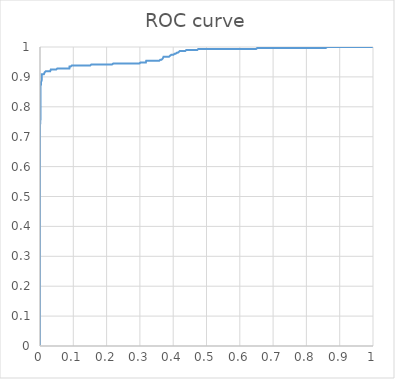
| Category | 1  -специфичность |
|---|---|
| 0.0 | 0.003 |
| 0.0 | 0.007 |
| 0.0 | 0.01 |
| 0.0 | 0.013 |
| 0.0 | 0.016 |
| 0.0 | 0.02 |
| 0.0 | 0.023 |
| 0.0 | 0.026 |
| 0.0 | 0.029 |
| 0.0 | 0.033 |
| 0.0 | 0.036 |
| 0.0 | 0.039 |
| 0.0 | 0.042 |
| 0.0 | 0.046 |
| 0.0 | 0.049 |
| 0.0 | 0.052 |
| 0.0 | 0.055 |
| 0.0 | 0.059 |
| 0.0 | 0.062 |
| 0.0 | 0.065 |
| 0.0 | 0.068 |
| 0.0 | 0.072 |
| 0.0 | 0.075 |
| 0.0 | 0.078 |
| 0.0 | 0.081 |
| 0.0 | 0.085 |
| 0.0 | 0.088 |
| 0.0 | 0.091 |
| 0.0 | 0.094 |
| 0.0 | 0.098 |
| 0.0 | 0.101 |
| 0.0 | 0.104 |
| 0.0 | 0.107 |
| 0.0 | 0.111 |
| 0.0 | 0.114 |
| 0.0 | 0.117 |
| 0.0 | 0.121 |
| 0.0 | 0.124 |
| 0.0 | 0.127 |
| 0.0 | 0.13 |
| 0.0 | 0.134 |
| 0.0 | 0.137 |
| 0.0 | 0.14 |
| 0.0 | 0.143 |
| 0.0 | 0.147 |
| 0.0 | 0.15 |
| 0.0 | 0.153 |
| 0.0 | 0.156 |
| 0.0 | 0.16 |
| 0.0 | 0.163 |
| 0.0 | 0.166 |
| 0.0 | 0.169 |
| 0.0 | 0.173 |
| 0.0 | 0.176 |
| 0.0 | 0.179 |
| 0.0 | 0.182 |
| 0.0 | 0.186 |
| 0.0 | 0.189 |
| 0.0 | 0.192 |
| 0.0 | 0.195 |
| 0.0 | 0.199 |
| 0.0 | 0.202 |
| 0.0 | 0.205 |
| 0.0 | 0.208 |
| 0.0 | 0.212 |
| 0.0 | 0.215 |
| 0.0 | 0.218 |
| 0.0 | 0.221 |
| 0.0 | 0.225 |
| 0.0 | 0.228 |
| 0.0 | 0.231 |
| 0.0 | 0.235 |
| 0.0 | 0.238 |
| 0.0 | 0.241 |
| 0.0 | 0.244 |
| 0.0 | 0.248 |
| 0.0 | 0.251 |
| 0.0 | 0.254 |
| 0.0 | 0.257 |
| 0.0 | 0.261 |
| 0.0 | 0.264 |
| 0.0 | 0.267 |
| 0.0 | 0.27 |
| 0.0 | 0.274 |
| 0.0 | 0.277 |
| 0.0 | 0.28 |
| 0.0 | 0.283 |
| 0.0 | 0.287 |
| 0.0 | 0.29 |
| 0.0 | 0.293 |
| 0.0 | 0.296 |
| 0.0 | 0.3 |
| 0.0 | 0.303 |
| 0.0 | 0.306 |
| 0.0 | 0.309 |
| 0.0 | 0.313 |
| 0.0 | 0.316 |
| 0.0 | 0.319 |
| 0.0 | 0.322 |
| 0.0 | 0.326 |
| 0.0 | 0.329 |
| 0.0 | 0.332 |
| 0.0 | 0.336 |
| 0.0 | 0.339 |
| 0.0 | 0.342 |
| 0.0 | 0.345 |
| 0.0 | 0.349 |
| 0.0 | 0.352 |
| 0.0 | 0.355 |
| 0.0 | 0.358 |
| 0.0 | 0.362 |
| 0.0 | 0.365 |
| 0.0 | 0.368 |
| 0.0 | 0.371 |
| 0.0 | 0.375 |
| 0.0 | 0.378 |
| 0.0 | 0.381 |
| 0.0 | 0.384 |
| 0.0 | 0.388 |
| 0.0 | 0.391 |
| 0.0 | 0.394 |
| 0.0 | 0.397 |
| 0.0 | 0.401 |
| 0.0 | 0.404 |
| 0.0 | 0.407 |
| 0.0 | 0.41 |
| 0.0 | 0.414 |
| 0.0 | 0.417 |
| 0.0 | 0.42 |
| 0.0 | 0.423 |
| 0.0 | 0.427 |
| 0.0 | 0.43 |
| 0.0 | 0.433 |
| 0.0 | 0.436 |
| 0.0 | 0.44 |
| 0.0 | 0.443 |
| 0.0 | 0.446 |
| 0.0 | 0.45 |
| 0.0 | 0.453 |
| 0.0 | 0.456 |
| 0.0 | 0.459 |
| 0.0 | 0.463 |
| 0.0 | 0.466 |
| 0.0 | 0.469 |
| 0.0 | 0.472 |
| 0.0 | 0.476 |
| 0.0 | 0.479 |
| 0.0 | 0.482 |
| 0.0 | 0.485 |
| 0.0 | 0.489 |
| 0.0 | 0.492 |
| 0.0 | 0.495 |
| 0.0 | 0.498 |
| 0.0 | 0.502 |
| 0.0 | 0.505 |
| 0.0 | 0.508 |
| 0.0 | 0.511 |
| 0.0 | 0.515 |
| 0.0 | 0.518 |
| 0.0 | 0.521 |
| 0.0 | 0.524 |
| 0.0 | 0.528 |
| 0.0 | 0.531 |
| 0.0 | 0.534 |
| 0.0 | 0.537 |
| 0.0 | 0.541 |
| 0.0 | 0.544 |
| 0.0 | 0.547 |
| 0.0 | 0.55 |
| 0.0 | 0.554 |
| 0.0 | 0.557 |
| 0.0 | 0.56 |
| 0.0 | 0.564 |
| 0.0 | 0.567 |
| 0.0 | 0.57 |
| 0.0 | 0.573 |
| 0.0 | 0.577 |
| 0.0 | 0.58 |
| 0.0 | 0.583 |
| 0.0 | 0.586 |
| 0.0 | 0.59 |
| 0.0 | 0.593 |
| 0.0 | 0.596 |
| 0.0 | 0.599 |
| 0.0 | 0.603 |
| 0.0 | 0.606 |
| 0.0 | 0.609 |
| 0.0 | 0.612 |
| 0.0 | 0.616 |
| 0.0 | 0.619 |
| 0.0 | 0.622 |
| 0.0 | 0.625 |
| 0.0 | 0.629 |
| 0.0 | 0.632 |
| 0.0 | 0.635 |
| 0.0 | 0.638 |
| 0.0 | 0.642 |
| 0.0 | 0.645 |
| 0.0 | 0.648 |
| 0.0 | 0.651 |
| 0.0 | 0.655 |
| 0.0 | 0.658 |
| 0.0 | 0.661 |
| 0.0 | 0.664 |
| 0.0 | 0.668 |
| 0.0 | 0.671 |
| 0.0 | 0.674 |
| 0.0 | 0.678 |
| 0.0 | 0.681 |
| 0.0 | 0.684 |
| 0.0 | 0.687 |
| 0.0 | 0.691 |
| 0.0 | 0.694 |
| 0.0 | 0.697 |
| 0.0 | 0.7 |
| 0.0 | 0.704 |
| 0.0 | 0.707 |
| 0.0 | 0.71 |
| 0.0 | 0.713 |
| 0.0 | 0.717 |
| 0.0 | 0.72 |
| 0.0 | 0.723 |
| 0.0 | 0.726 |
| 0.0 | 0.73 |
| 0.0 | 0.733 |
| 0.0 | 0.736 |
| 0.0 | 0.739 |
| 0.00046728971962616824 | 0.739 |
| 0.00046728971962616824 | 0.743 |
| 0.0009345794392523365 | 0.743 |
| 0.0009345794392523365 | 0.746 |
| 0.0009345794392523365 | 0.749 |
| 0.0009345794392523365 | 0.752 |
| 0.0014018691588785046 | 0.752 |
| 0.0014018691588785046 | 0.756 |
| 0.0014018691588785046 | 0.759 |
| 0.0014018691588785046 | 0.762 |
| 0.0014018691588785046 | 0.765 |
| 0.0014018691588785046 | 0.769 |
| 0.0014018691588785046 | 0.772 |
| 0.0014018691588785046 | 0.775 |
| 0.0014018691588785046 | 0.779 |
| 0.0014018691588785046 | 0.782 |
| 0.0014018691588785046 | 0.785 |
| 0.0014018691588785046 | 0.788 |
| 0.0014018691588785046 | 0.792 |
| 0.0014018691588785046 | 0.795 |
| 0.0014018691588785046 | 0.798 |
| 0.0014018691588785046 | 0.801 |
| 0.0014018691588785046 | 0.805 |
| 0.0014018691588785046 | 0.808 |
| 0.0014018691588785046 | 0.811 |
| 0.0014018691588785046 | 0.814 |
| 0.0014018691588785046 | 0.818 |
| 0.0014018691588785046 | 0.821 |
| 0.0014018691588785046 | 0.824 |
| 0.0014018691588785046 | 0.827 |
| 0.0014018691588785046 | 0.831 |
| 0.0014018691588785046 | 0.834 |
| 0.0014018691588785046 | 0.837 |
| 0.0014018691588785046 | 0.84 |
| 0.0014018691588785046 | 0.844 |
| 0.0014018691588785046 | 0.847 |
| 0.0014018691588785046 | 0.85 |
| 0.0014018691588785046 | 0.853 |
| 0.0014018691588785046 | 0.857 |
| 0.0014018691588785046 | 0.86 |
| 0.0014018691588785046 | 0.863 |
| 0.0014018691588785046 | 0.866 |
| 0.001869158878504673 | 0.866 |
| 0.001869158878504673 | 0.87 |
| 0.002336448598130841 | 0.87 |
| 0.002803738317757009 | 0.87 |
| 0.0032710280373831778 | 0.87 |
| 0.0032710280373831778 | 0.873 |
| 0.0032710280373831778 | 0.876 |
| 0.0032710280373831778 | 0.879 |
| 0.0032710280373831778 | 0.883 |
| 0.0032710280373831778 | 0.886 |
| 0.003738317757009346 | 0.886 |
| 0.004205607476635514 | 0.886 |
| 0.004672897196261682 | 0.886 |
| 0.0051401869158878505 | 0.886 |
| 0.0051401869158878505 | 0.889 |
| 0.0051401869158878505 | 0.893 |
| 0.0051401869158878505 | 0.896 |
| 0.0051401869158878505 | 0.899 |
| 0.0051401869158878505 | 0.902 |
| 0.0051401869158878505 | 0.906 |
| 0.0051401869158878505 | 0.909 |
| 0.005607476635514018 | 0.909 |
| 0.006074766355140187 | 0.909 |
| 0.0065420560747663555 | 0.909 |
| 0.007009345794392523 | 0.909 |
| 0.007476635514018692 | 0.909 |
| 0.00794392523364486 | 0.909 |
| 0.008411214953271028 | 0.909 |
| 0.008878504672897197 | 0.909 |
| 0.009345794392523364 | 0.909 |
| 0.009813084112149532 | 0.909 |
| 0.010280373831775701 | 0.909 |
| 0.01074766355140187 | 0.909 |
| 0.011214953271028037 | 0.909 |
| 0.011682242990654205 | 0.909 |
| 0.012149532710280374 | 0.909 |
| 0.012616822429906542 | 0.909 |
| 0.012616822429906542 | 0.912 |
| 0.013084112149532711 | 0.912 |
| 0.013551401869158878 | 0.912 |
| 0.014018691588785047 | 0.912 |
| 0.014018691588785047 | 0.915 |
| 0.014018691588785047 | 0.919 |
| 0.014485981308411215 | 0.919 |
| 0.014953271028037384 | 0.919 |
| 0.01542056074766355 | 0.919 |
| 0.01588785046728972 | 0.919 |
| 0.016355140186915886 | 0.919 |
| 0.016822429906542057 | 0.919 |
| 0.017289719626168223 | 0.919 |
| 0.017757009345794394 | 0.919 |
| 0.01822429906542056 | 0.919 |
| 0.018691588785046728 | 0.919 |
| 0.019158878504672898 | 0.919 |
| 0.019626168224299065 | 0.919 |
| 0.020093457943925235 | 0.919 |
| 0.020560747663551402 | 0.919 |
| 0.02102803738317757 | 0.919 |
| 0.02149532710280374 | 0.919 |
| 0.021962616822429906 | 0.919 |
| 0.022429906542056073 | 0.919 |
| 0.022897196261682243 | 0.919 |
| 0.02336448598130841 | 0.919 |
| 0.02383177570093458 | 0.919 |
| 0.024299065420560748 | 0.919 |
| 0.024766355140186914 | 0.919 |
| 0.025233644859813085 | 0.919 |
| 0.02570093457943925 | 0.919 |
| 0.026168224299065422 | 0.919 |
| 0.02663551401869159 | 0.919 |
| 0.027102803738317756 | 0.919 |
| 0.027570093457943926 | 0.919 |
| 0.028037383177570093 | 0.919 |
| 0.02850467289719626 | 0.919 |
| 0.02897196261682243 | 0.919 |
| 0.029439252336448597 | 0.919 |
| 0.029906542056074768 | 0.919 |
| 0.030373831775700934 | 0.919 |
| 0.0308411214953271 | 0.919 |
| 0.03130841121495327 | 0.919 |
| 0.03177570093457944 | 0.919 |
| 0.032242990654205606 | 0.919 |
| 0.03271028037383177 | 0.919 |
| 0.03271028037383177 | 0.922 |
| 0.03271028037383177 | 0.925 |
| 0.033177570093457946 | 0.925 |
| 0.03364485981308411 | 0.925 |
| 0.03411214953271028 | 0.925 |
| 0.03457943925233645 | 0.925 |
| 0.035046728971962614 | 0.925 |
| 0.03551401869158879 | 0.925 |
| 0.035981308411214954 | 0.925 |
| 0.03644859813084112 | 0.925 |
| 0.03691588785046729 | 0.925 |
| 0.037383177570093455 | 0.925 |
| 0.03785046728971963 | 0.925 |
| 0.038317757009345796 | 0.925 |
| 0.03878504672897196 | 0.925 |
| 0.03925233644859813 | 0.925 |
| 0.0397196261682243 | 0.925 |
| 0.04018691588785047 | 0.925 |
| 0.04065420560747664 | 0.925 |
| 0.041121495327102804 | 0.925 |
| 0.04158878504672897 | 0.925 |
| 0.04205607476635514 | 0.925 |
| 0.04252336448598131 | 0.925 |
| 0.04299065420560748 | 0.925 |
| 0.043457943925233646 | 0.925 |
| 0.04392523364485981 | 0.925 |
| 0.04439252336448598 | 0.925 |
| 0.044859813084112146 | 0.925 |
| 0.04532710280373832 | 0.925 |
| 0.04579439252336449 | 0.925 |
| 0.046261682242990654 | 0.925 |
| 0.04672897196261682 | 0.925 |
| 0.04719626168224299 | 0.925 |
| 0.04766355140186916 | 0.925 |
| 0.04813084112149533 | 0.925 |
| 0.048598130841121495 | 0.925 |
| 0.04906542056074766 | 0.925 |
| 0.04953271028037383 | 0.925 |
| 0.05 | 0.925 |
| 0.05046728971962617 | 0.925 |
| 0.05093457943925234 | 0.925 |
| 0.05093457943925234 | 0.928 |
| 0.0514018691588785 | 0.928 |
| 0.05186915887850467 | 0.928 |
| 0.052336448598130844 | 0.928 |
| 0.05280373831775701 | 0.928 |
| 0.05327102803738318 | 0.928 |
| 0.053738317757009345 | 0.928 |
| 0.05420560747663551 | 0.928 |
| 0.054672897196261686 | 0.928 |
| 0.05514018691588785 | 0.928 |
| 0.05560747663551402 | 0.928 |
| 0.056074766355140186 | 0.928 |
| 0.05654205607476635 | 0.928 |
| 0.05700934579439252 | 0.928 |
| 0.057476635514018694 | 0.928 |
| 0.05794392523364486 | 0.928 |
| 0.05841121495327103 | 0.928 |
| 0.058878504672897194 | 0.928 |
| 0.05934579439252336 | 0.928 |
| 0.059813084112149535 | 0.928 |
| 0.0602803738317757 | 0.928 |
| 0.06074766355140187 | 0.928 |
| 0.061214953271028036 | 0.928 |
| 0.0616822429906542 | 0.928 |
| 0.06214953271028038 | 0.928 |
| 0.06261682242990654 | 0.928 |
| 0.0630841121495327 | 0.928 |
| 0.06355140186915888 | 0.928 |
| 0.06401869158878505 | 0.928 |
| 0.06448598130841121 | 0.928 |
| 0.06495327102803738 | 0.928 |
| 0.06542056074766354 | 0.928 |
| 0.06588785046728972 | 0.928 |
| 0.06635514018691589 | 0.928 |
| 0.06682242990654205 | 0.928 |
| 0.06728971962616823 | 0.928 |
| 0.06775700934579439 | 0.928 |
| 0.06822429906542056 | 0.928 |
| 0.06869158878504673 | 0.928 |
| 0.0691588785046729 | 0.928 |
| 0.06962616822429907 | 0.928 |
| 0.07009345794392523 | 0.928 |
| 0.0705607476635514 | 0.928 |
| 0.07102803738317758 | 0.928 |
| 0.07149532710280374 | 0.928 |
| 0.07196261682242991 | 0.928 |
| 0.07242990654205607 | 0.928 |
| 0.07289719626168224 | 0.928 |
| 0.07336448598130842 | 0.928 |
| 0.07383177570093458 | 0.928 |
| 0.07429906542056075 | 0.928 |
| 0.07476635514018691 | 0.928 |
| 0.07523364485981308 | 0.928 |
| 0.07570093457943926 | 0.928 |
| 0.07616822429906542 | 0.928 |
| 0.07663551401869159 | 0.928 |
| 0.07710280373831775 | 0.928 |
| 0.07757009345794393 | 0.928 |
| 0.0780373831775701 | 0.928 |
| 0.07850467289719626 | 0.928 |
| 0.07897196261682243 | 0.928 |
| 0.0794392523364486 | 0.928 |
| 0.07990654205607477 | 0.928 |
| 0.08037383177570094 | 0.928 |
| 0.0808411214953271 | 0.928 |
| 0.08130841121495327 | 0.928 |
| 0.08177570093457943 | 0.928 |
| 0.08224299065420561 | 0.928 |
| 0.08271028037383178 | 0.928 |
| 0.08317757009345794 | 0.928 |
| 0.08364485981308412 | 0.928 |
| 0.08411214953271028 | 0.928 |
| 0.08457943925233645 | 0.928 |
| 0.08504672897196262 | 0.928 |
| 0.08551401869158878 | 0.928 |
| 0.08598130841121496 | 0.928 |
| 0.08644859813084112 | 0.928 |
| 0.08691588785046729 | 0.928 |
| 0.08738317757009346 | 0.928 |
| 0.08785046728971962 | 0.928 |
| 0.0883177570093458 | 0.928 |
| 0.08878504672897196 | 0.928 |
| 0.08878504672897196 | 0.932 |
| 0.08878504672897196 | 0.935 |
| 0.08925233644859813 | 0.935 |
| 0.08971962616822429 | 0.935 |
| 0.09018691588785047 | 0.935 |
| 0.09065420560747664 | 0.935 |
| 0.0911214953271028 | 0.935 |
| 0.09158878504672897 | 0.935 |
| 0.09205607476635513 | 0.935 |
| 0.09252336448598131 | 0.935 |
| 0.09299065420560748 | 0.935 |
| 0.09345794392523364 | 0.935 |
| 0.09392523364485982 | 0.935 |
| 0.09439252336448598 | 0.935 |
| 0.09485981308411215 | 0.935 |
| 0.09485981308411215 | 0.938 |
| 0.09532710280373832 | 0.938 |
| 0.09579439252336448 | 0.938 |
| 0.09626168224299066 | 0.938 |
| 0.09672897196261682 | 0.938 |
| 0.09719626168224299 | 0.938 |
| 0.09766355140186916 | 0.938 |
| 0.09813084112149532 | 0.938 |
| 0.0985981308411215 | 0.938 |
| 0.09906542056074766 | 0.938 |
| 0.09953271028037383 | 0.938 |
| 0.1 | 0.938 |
| 0.10046728971962617 | 0.938 |
| 0.10093457943925234 | 0.938 |
| 0.1014018691588785 | 0.938 |
| 0.10186915887850467 | 0.938 |
| 0.10233644859813085 | 0.938 |
| 0.102803738317757 | 0.938 |
| 0.10327102803738318 | 0.938 |
| 0.10373831775700934 | 0.938 |
| 0.10420560747663551 | 0.938 |
| 0.10467289719626169 | 0.938 |
| 0.10514018691588785 | 0.938 |
| 0.10560747663551402 | 0.938 |
| 0.10607476635514018 | 0.938 |
| 0.10654205607476636 | 0.938 |
| 0.10700934579439253 | 0.938 |
| 0.10747663551401869 | 0.938 |
| 0.10794392523364486 | 0.938 |
| 0.10841121495327102 | 0.938 |
| 0.1088785046728972 | 0.938 |
| 0.10934579439252337 | 0.938 |
| 0.10981308411214953 | 0.938 |
| 0.1102803738317757 | 0.938 |
| 0.11074766355140186 | 0.938 |
| 0.11121495327102804 | 0.938 |
| 0.11168224299065421 | 0.938 |
| 0.11214953271028037 | 0.938 |
| 0.11261682242990655 | 0.938 |
| 0.1130841121495327 | 0.938 |
| 0.11355140186915888 | 0.938 |
| 0.11401869158878504 | 0.938 |
| 0.11448598130841121 | 0.938 |
| 0.11495327102803739 | 0.938 |
| 0.11542056074766355 | 0.938 |
| 0.11588785046728972 | 0.938 |
| 0.11635514018691588 | 0.938 |
| 0.11682242990654206 | 0.938 |
| 0.11728971962616823 | 0.938 |
| 0.11775700934579439 | 0.938 |
| 0.11822429906542056 | 0.938 |
| 0.11869158878504672 | 0.938 |
| 0.1191588785046729 | 0.938 |
| 0.11962616822429907 | 0.938 |
| 0.12009345794392523 | 0.938 |
| 0.1205607476635514 | 0.938 |
| 0.12102803738317756 | 0.938 |
| 0.12149532710280374 | 0.938 |
| 0.12196261682242991 | 0.938 |
| 0.12242990654205607 | 0.938 |
| 0.12289719626168225 | 0.938 |
| 0.1233644859813084 | 0.938 |
| 0.12383177570093458 | 0.938 |
| 0.12429906542056075 | 0.938 |
| 0.12476635514018691 | 0.938 |
| 0.1252336448598131 | 0.938 |
| 0.12570093457943926 | 0.938 |
| 0.1261682242990654 | 0.938 |
| 0.12663551401869158 | 0.938 |
| 0.12710280373831775 | 0.938 |
| 0.12757009345794393 | 0.938 |
| 0.1280373831775701 | 0.938 |
| 0.12850467289719625 | 0.938 |
| 0.12897196261682242 | 0.938 |
| 0.1294392523364486 | 0.938 |
| 0.12990654205607477 | 0.938 |
| 0.13037383177570094 | 0.938 |
| 0.1308411214953271 | 0.938 |
| 0.13130841121495326 | 0.938 |
| 0.13177570093457944 | 0.938 |
| 0.1322429906542056 | 0.938 |
| 0.13271028037383178 | 0.938 |
| 0.13317757009345793 | 0.938 |
| 0.1336448598130841 | 0.938 |
| 0.13411214953271028 | 0.938 |
| 0.13457943925233645 | 0.938 |
| 0.13504672897196263 | 0.938 |
| 0.13551401869158877 | 0.938 |
| 0.13598130841121495 | 0.938 |
| 0.13644859813084112 | 0.938 |
| 0.1369158878504673 | 0.938 |
| 0.13738317757009347 | 0.938 |
| 0.1378504672897196 | 0.938 |
| 0.1383177570093458 | 0.938 |
| 0.13878504672897196 | 0.938 |
| 0.13925233644859814 | 0.938 |
| 0.1397196261682243 | 0.938 |
| 0.14018691588785046 | 0.938 |
| 0.14065420560747663 | 0.938 |
| 0.1411214953271028 | 0.938 |
| 0.14158878504672898 | 0.938 |
| 0.14205607476635515 | 0.938 |
| 0.1425233644859813 | 0.938 |
| 0.14299065420560747 | 0.938 |
| 0.14345794392523364 | 0.938 |
| 0.14392523364485982 | 0.938 |
| 0.144392523364486 | 0.938 |
| 0.14485981308411214 | 0.938 |
| 0.1453271028037383 | 0.938 |
| 0.14579439252336449 | 0.938 |
| 0.14626168224299066 | 0.938 |
| 0.14672897196261683 | 0.938 |
| 0.14719626168224298 | 0.938 |
| 0.14766355140186915 | 0.938 |
| 0.14813084112149533 | 0.938 |
| 0.1485981308411215 | 0.938 |
| 0.14906542056074767 | 0.938 |
| 0.14953271028037382 | 0.938 |
| 0.15 | 0.938 |
| 0.15046728971962617 | 0.938 |
| 0.15093457943925234 | 0.938 |
| 0.15093457943925234 | 0.941 |
| 0.15140186915887852 | 0.941 |
| 0.15186915887850466 | 0.941 |
| 0.15233644859813084 | 0.941 |
| 0.152803738317757 | 0.941 |
| 0.15327102803738318 | 0.941 |
| 0.15373831775700936 | 0.941 |
| 0.1542056074766355 | 0.941 |
| 0.15467289719626168 | 0.941 |
| 0.15514018691588785 | 0.941 |
| 0.15560747663551402 | 0.941 |
| 0.1560747663551402 | 0.941 |
| 0.15654205607476634 | 0.941 |
| 0.15700934579439252 | 0.941 |
| 0.1574766355140187 | 0.941 |
| 0.15794392523364487 | 0.941 |
| 0.15841121495327104 | 0.941 |
| 0.1588785046728972 | 0.941 |
| 0.15934579439252336 | 0.941 |
| 0.15981308411214953 | 0.941 |
| 0.1602803738317757 | 0.941 |
| 0.16074766355140188 | 0.941 |
| 0.16121495327102803 | 0.941 |
| 0.1616822429906542 | 0.941 |
| 0.16214953271028038 | 0.941 |
| 0.16261682242990655 | 0.941 |
| 0.16308411214953272 | 0.941 |
| 0.16355140186915887 | 0.941 |
| 0.16401869158878504 | 0.941 |
| 0.16448598130841122 | 0.941 |
| 0.1649532710280374 | 0.941 |
| 0.16542056074766356 | 0.941 |
| 0.1658878504672897 | 0.941 |
| 0.16635514018691588 | 0.941 |
| 0.16682242990654206 | 0.941 |
| 0.16728971962616823 | 0.941 |
| 0.1677570093457944 | 0.941 |
| 0.16822429906542055 | 0.941 |
| 0.16869158878504673 | 0.941 |
| 0.1691588785046729 | 0.941 |
| 0.16962616822429907 | 0.941 |
| 0.17009345794392525 | 0.941 |
| 0.1705607476635514 | 0.941 |
| 0.17102803738317757 | 0.941 |
| 0.17149532710280374 | 0.941 |
| 0.17196261682242991 | 0.941 |
| 0.1724299065420561 | 0.941 |
| 0.17289719626168223 | 0.941 |
| 0.1733644859813084 | 0.941 |
| 0.17383177570093458 | 0.941 |
| 0.17429906542056076 | 0.941 |
| 0.17476635514018693 | 0.941 |
| 0.17523364485981308 | 0.941 |
| 0.17570093457943925 | 0.941 |
| 0.17616822429906542 | 0.941 |
| 0.1766355140186916 | 0.941 |
| 0.17710280373831774 | 0.941 |
| 0.17757009345794392 | 0.941 |
| 0.1780373831775701 | 0.941 |
| 0.17850467289719626 | 0.941 |
| 0.17897196261682244 | 0.941 |
| 0.17943925233644858 | 0.941 |
| 0.17990654205607476 | 0.941 |
| 0.18037383177570093 | 0.941 |
| 0.1808411214953271 | 0.941 |
| 0.18130841121495328 | 0.941 |
| 0.18177570093457943 | 0.941 |
| 0.1822429906542056 | 0.941 |
| 0.18271028037383177 | 0.941 |
| 0.18317757009345795 | 0.941 |
| 0.18364485981308412 | 0.941 |
| 0.18411214953271027 | 0.941 |
| 0.18457943925233644 | 0.941 |
| 0.18504672897196262 | 0.941 |
| 0.1855140186915888 | 0.941 |
| 0.18598130841121496 | 0.941 |
| 0.1864485981308411 | 0.941 |
| 0.18691588785046728 | 0.941 |
| 0.18738317757009346 | 0.941 |
| 0.18785046728971963 | 0.941 |
| 0.1883177570093458 | 0.941 |
| 0.18878504672897195 | 0.941 |
| 0.18925233644859812 | 0.941 |
| 0.1897196261682243 | 0.941 |
| 0.19018691588785047 | 0.941 |
| 0.19065420560747665 | 0.941 |
| 0.1911214953271028 | 0.941 |
| 0.19158878504672897 | 0.941 |
| 0.19205607476635514 | 0.941 |
| 0.1925233644859813 | 0.941 |
| 0.1929906542056075 | 0.941 |
| 0.19345794392523363 | 0.941 |
| 0.1939252336448598 | 0.941 |
| 0.19439252336448598 | 0.941 |
| 0.19485981308411215 | 0.941 |
| 0.19532710280373833 | 0.941 |
| 0.19579439252336447 | 0.941 |
| 0.19626168224299065 | 0.941 |
| 0.19672897196261682 | 0.941 |
| 0.197196261682243 | 0.941 |
| 0.19766355140186917 | 0.941 |
| 0.19813084112149532 | 0.941 |
| 0.1985981308411215 | 0.941 |
| 0.19906542056074766 | 0.941 |
| 0.19953271028037384 | 0.941 |
| 0.2 | 0.941 |
| 0.20046728971962616 | 0.941 |
| 0.20093457943925233 | 0.941 |
| 0.2014018691588785 | 0.941 |
| 0.20186915887850468 | 0.941 |
| 0.20233644859813085 | 0.941 |
| 0.202803738317757 | 0.941 |
| 0.20327102803738317 | 0.941 |
| 0.20373831775700935 | 0.941 |
| 0.20420560747663552 | 0.941 |
| 0.2046728971962617 | 0.941 |
| 0.20514018691588784 | 0.941 |
| 0.205607476635514 | 0.941 |
| 0.2060747663551402 | 0.941 |
| 0.20654205607476636 | 0.941 |
| 0.20700934579439254 | 0.941 |
| 0.20747663551401868 | 0.941 |
| 0.20794392523364486 | 0.941 |
| 0.20841121495327103 | 0.941 |
| 0.2088785046728972 | 0.941 |
| 0.20934579439252338 | 0.941 |
| 0.20981308411214952 | 0.941 |
| 0.2102803738317757 | 0.941 |
| 0.21074766355140187 | 0.941 |
| 0.21121495327102804 | 0.941 |
| 0.21168224299065422 | 0.941 |
| 0.21214953271028036 | 0.941 |
| 0.21261682242990654 | 0.941 |
| 0.2130841121495327 | 0.941 |
| 0.21355140186915889 | 0.941 |
| 0.21401869158878506 | 0.941 |
| 0.2144859813084112 | 0.941 |
| 0.21495327102803738 | 0.941 |
| 0.21542056074766355 | 0.941 |
| 0.21588785046728973 | 0.941 |
| 0.2163551401869159 | 0.941 |
| 0.21682242990654205 | 0.941 |
| 0.21728971962616822 | 0.941 |
| 0.2177570093457944 | 0.941 |
| 0.21822429906542057 | 0.941 |
| 0.21869158878504674 | 0.941 |
| 0.21869158878504674 | 0.945 |
| 0.2191588785046729 | 0.945 |
| 0.21962616822429906 | 0.945 |
| 0.22009345794392524 | 0.945 |
| 0.2205607476635514 | 0.945 |
| 0.22102803738317758 | 0.945 |
| 0.22149532710280373 | 0.945 |
| 0.2219626168224299 | 0.945 |
| 0.22242990654205608 | 0.945 |
| 0.22289719626168225 | 0.945 |
| 0.22336448598130842 | 0.945 |
| 0.22383177570093457 | 0.945 |
| 0.22429906542056074 | 0.945 |
| 0.22476635514018692 | 0.945 |
| 0.2252336448598131 | 0.945 |
| 0.22570093457943924 | 0.945 |
| 0.2261682242990654 | 0.945 |
| 0.2266355140186916 | 0.945 |
| 0.22710280373831776 | 0.945 |
| 0.22757009345794393 | 0.945 |
| 0.22803738317757008 | 0.945 |
| 0.22850467289719625 | 0.945 |
| 0.22897196261682243 | 0.945 |
| 0.2294392523364486 | 0.945 |
| 0.22990654205607478 | 0.945 |
| 0.23037383177570092 | 0.945 |
| 0.2308411214953271 | 0.945 |
| 0.23130841121495327 | 0.945 |
| 0.23177570093457944 | 0.945 |
| 0.23224299065420562 | 0.945 |
| 0.23271028037383176 | 0.945 |
| 0.23317757009345794 | 0.945 |
| 0.2336448598130841 | 0.945 |
| 0.23411214953271028 | 0.945 |
| 0.23457943925233646 | 0.945 |
| 0.2350467289719626 | 0.945 |
| 0.23551401869158878 | 0.945 |
| 0.23598130841121495 | 0.945 |
| 0.23644859813084113 | 0.945 |
| 0.2369158878504673 | 0.945 |
| 0.23738317757009345 | 0.945 |
| 0.23785046728971962 | 0.945 |
| 0.2383177570093458 | 0.945 |
| 0.23878504672897197 | 0.945 |
| 0.23925233644859814 | 0.945 |
| 0.2397196261682243 | 0.945 |
| 0.24018691588785046 | 0.945 |
| 0.24065420560747663 | 0.945 |
| 0.2411214953271028 | 0.945 |
| 0.24158878504672898 | 0.945 |
| 0.24205607476635513 | 0.945 |
| 0.2425233644859813 | 0.945 |
| 0.24299065420560748 | 0.945 |
| 0.24345794392523365 | 0.945 |
| 0.24392523364485982 | 0.945 |
| 0.24439252336448597 | 0.945 |
| 0.24485981308411214 | 0.945 |
| 0.24532710280373832 | 0.945 |
| 0.2457943925233645 | 0.945 |
| 0.24626168224299066 | 0.945 |
| 0.2467289719626168 | 0.945 |
| 0.24719626168224298 | 0.945 |
| 0.24766355140186916 | 0.945 |
| 0.24813084112149533 | 0.945 |
| 0.2485981308411215 | 0.945 |
| 0.24906542056074765 | 0.945 |
| 0.24953271028037383 | 0.945 |
| 0.25 | 0.945 |
| 0.2504672897196262 | 0.945 |
| 0.25093457943925235 | 0.945 |
| 0.2514018691588785 | 0.945 |
| 0.2518691588785047 | 0.945 |
| 0.2523364485981308 | 0.945 |
| 0.252803738317757 | 0.945 |
| 0.25327102803738316 | 0.945 |
| 0.25373831775700934 | 0.945 |
| 0.2542056074766355 | 0.945 |
| 0.2546728971962617 | 0.945 |
| 0.25514018691588786 | 0.945 |
| 0.25560747663551403 | 0.945 |
| 0.2560747663551402 | 0.945 |
| 0.2565420560747664 | 0.945 |
| 0.2570093457943925 | 0.945 |
| 0.25747663551401867 | 0.945 |
| 0.25794392523364484 | 0.945 |
| 0.258411214953271 | 0.945 |
| 0.2588785046728972 | 0.945 |
| 0.25934579439252337 | 0.945 |
| 0.25981308411214954 | 0.945 |
| 0.2602803738317757 | 0.945 |
| 0.2607476635514019 | 0.945 |
| 0.26121495327102806 | 0.945 |
| 0.2616822429906542 | 0.945 |
| 0.26214953271028035 | 0.945 |
| 0.2626168224299065 | 0.945 |
| 0.2630841121495327 | 0.945 |
| 0.2635514018691589 | 0.945 |
| 0.26401869158878505 | 0.945 |
| 0.2644859813084112 | 0.945 |
| 0.2649532710280374 | 0.945 |
| 0.26542056074766357 | 0.945 |
| 0.26588785046728974 | 0.945 |
| 0.26635514018691586 | 0.945 |
| 0.26682242990654204 | 0.945 |
| 0.2672897196261682 | 0.945 |
| 0.2677570093457944 | 0.945 |
| 0.26822429906542056 | 0.945 |
| 0.26869158878504673 | 0.945 |
| 0.2691588785046729 | 0.945 |
| 0.2696261682242991 | 0.945 |
| 0.27009345794392525 | 0.945 |
| 0.2705607476635514 | 0.945 |
| 0.27102803738317754 | 0.945 |
| 0.2714953271028037 | 0.945 |
| 0.2719626168224299 | 0.945 |
| 0.27242990654205607 | 0.945 |
| 0.27289719626168224 | 0.945 |
| 0.2733644859813084 | 0.945 |
| 0.2738317757009346 | 0.945 |
| 0.27429906542056076 | 0.945 |
| 0.27476635514018694 | 0.945 |
| 0.2752336448598131 | 0.945 |
| 0.2757009345794392 | 0.945 |
| 0.2761682242990654 | 0.945 |
| 0.2766355140186916 | 0.945 |
| 0.27710280373831775 | 0.945 |
| 0.2775700934579439 | 0.945 |
| 0.2780373831775701 | 0.945 |
| 0.27850467289719627 | 0.945 |
| 0.27897196261682244 | 0.945 |
| 0.2794392523364486 | 0.945 |
| 0.2799065420560748 | 0.945 |
| 0.2803738317757009 | 0.945 |
| 0.2808411214953271 | 0.945 |
| 0.28130841121495326 | 0.945 |
| 0.28177570093457943 | 0.945 |
| 0.2822429906542056 | 0.945 |
| 0.2827102803738318 | 0.945 |
| 0.28317757009345795 | 0.945 |
| 0.2836448598130841 | 0.945 |
| 0.2841121495327103 | 0.945 |
| 0.2845794392523365 | 0.945 |
| 0.2850467289719626 | 0.945 |
| 0.28551401869158877 | 0.945 |
| 0.28598130841121494 | 0.945 |
| 0.2864485981308411 | 0.945 |
| 0.2869158878504673 | 0.945 |
| 0.28738317757009346 | 0.945 |
| 0.28785046728971964 | 0.945 |
| 0.2883177570093458 | 0.945 |
| 0.288785046728972 | 0.945 |
| 0.28925233644859816 | 0.945 |
| 0.2897196261682243 | 0.945 |
| 0.29018691588785045 | 0.945 |
| 0.2906542056074766 | 0.945 |
| 0.2911214953271028 | 0.945 |
| 0.29158878504672897 | 0.945 |
| 0.29205607476635514 | 0.945 |
| 0.2925233644859813 | 0.945 |
| 0.2929906542056075 | 0.945 |
| 0.29345794392523367 | 0.945 |
| 0.29392523364485984 | 0.945 |
| 0.29439252336448596 | 0.945 |
| 0.29485981308411213 | 0.945 |
| 0.2953271028037383 | 0.945 |
| 0.2957943925233645 | 0.945 |
| 0.29626168224299065 | 0.945 |
| 0.2967289719626168 | 0.945 |
| 0.297196261682243 | 0.945 |
| 0.2976635514018692 | 0.945 |
| 0.29813084112149535 | 0.945 |
| 0.2985981308411215 | 0.945 |
| 0.2985981308411215 | 0.948 |
| 0.29906542056074764 | 0.948 |
| 0.2995327102803738 | 0.948 |
| 0.3 | 0.948 |
| 0.30046728971962616 | 0.948 |
| 0.30093457943925234 | 0.948 |
| 0.3014018691588785 | 0.948 |
| 0.3018691588785047 | 0.948 |
| 0.30233644859813086 | 0.948 |
| 0.30280373831775703 | 0.948 |
| 0.30327102803738315 | 0.948 |
| 0.3037383177570093 | 0.948 |
| 0.3042056074766355 | 0.948 |
| 0.30467289719626167 | 0.948 |
| 0.30514018691588785 | 0.948 |
| 0.305607476635514 | 0.948 |
| 0.3060747663551402 | 0.948 |
| 0.30654205607476637 | 0.948 |
| 0.30700934579439254 | 0.948 |
| 0.3074766355140187 | 0.948 |
| 0.30794392523364483 | 0.948 |
| 0.308411214953271 | 0.948 |
| 0.3088785046728972 | 0.948 |
| 0.30934579439252335 | 0.948 |
| 0.30981308411214953 | 0.948 |
| 0.3102803738317757 | 0.948 |
| 0.3107476635514019 | 0.948 |
| 0.31121495327102805 | 0.948 |
| 0.3116822429906542 | 0.948 |
| 0.3121495327102804 | 0.948 |
| 0.3126168224299065 | 0.948 |
| 0.3130841121495327 | 0.948 |
| 0.31355140186915886 | 0.948 |
| 0.31401869158878504 | 0.948 |
| 0.3144859813084112 | 0.948 |
| 0.3149532710280374 | 0.948 |
| 0.31542056074766356 | 0.948 |
| 0.31588785046728973 | 0.948 |
| 0.3163551401869159 | 0.948 |
| 0.3168224299065421 | 0.948 |
| 0.3172897196261682 | 0.948 |
| 0.3177570093457944 | 0.948 |
| 0.31822429906542055 | 0.948 |
| 0.3186915887850467 | 0.948 |
| 0.3191588785046729 | 0.948 |
| 0.3191588785046729 | 0.951 |
| 0.3191588785046729 | 0.954 |
| 0.31962616822429907 | 0.954 |
| 0.32009345794392524 | 0.954 |
| 0.3205607476635514 | 0.954 |
| 0.3210280373831776 | 0.954 |
| 0.32149532710280376 | 0.954 |
| 0.3219626168224299 | 0.954 |
| 0.32242990654205606 | 0.954 |
| 0.32289719626168223 | 0.954 |
| 0.3233644859813084 | 0.954 |
| 0.3238317757009346 | 0.954 |
| 0.32429906542056075 | 0.954 |
| 0.3247663551401869 | 0.954 |
| 0.3252336448598131 | 0.954 |
| 0.32570093457943927 | 0.954 |
| 0.32616822429906545 | 0.954 |
| 0.32663551401869156 | 0.954 |
| 0.32710280373831774 | 0.954 |
| 0.3275700934579439 | 0.954 |
| 0.3280373831775701 | 0.954 |
| 0.32850467289719626 | 0.954 |
| 0.32897196261682243 | 0.954 |
| 0.3294392523364486 | 0.954 |
| 0.3299065420560748 | 0.954 |
| 0.33037383177570095 | 0.954 |
| 0.33084112149532713 | 0.954 |
| 0.33130841121495325 | 0.954 |
| 0.3317757009345794 | 0.954 |
| 0.3322429906542056 | 0.954 |
| 0.33271028037383177 | 0.954 |
| 0.33317757009345794 | 0.954 |
| 0.3336448598130841 | 0.954 |
| 0.3341121495327103 | 0.954 |
| 0.33457943925233646 | 0.954 |
| 0.33504672897196264 | 0.954 |
| 0.3355140186915888 | 0.954 |
| 0.33598130841121493 | 0.954 |
| 0.3364485981308411 | 0.954 |
| 0.3369158878504673 | 0.954 |
| 0.33738317757009345 | 0.954 |
| 0.3378504672897196 | 0.954 |
| 0.3383177570093458 | 0.954 |
| 0.338785046728972 | 0.954 |
| 0.33925233644859815 | 0.954 |
| 0.3397196261682243 | 0.954 |
| 0.3401869158878505 | 0.954 |
| 0.3406542056074766 | 0.954 |
| 0.3411214953271028 | 0.954 |
| 0.34158878504672896 | 0.954 |
| 0.34205607476635513 | 0.954 |
| 0.3425233644859813 | 0.954 |
| 0.3429906542056075 | 0.954 |
| 0.34345794392523366 | 0.954 |
| 0.34392523364485983 | 0.954 |
| 0.344392523364486 | 0.954 |
| 0.3448598130841122 | 0.954 |
| 0.3453271028037383 | 0.954 |
| 0.34579439252336447 | 0.954 |
| 0.34626168224299064 | 0.954 |
| 0.3467289719626168 | 0.954 |
| 0.347196261682243 | 0.954 |
| 0.34766355140186916 | 0.954 |
| 0.34813084112149534 | 0.954 |
| 0.3485981308411215 | 0.954 |
| 0.3490654205607477 | 0.954 |
| 0.34953271028037386 | 0.954 |
| 0.35 | 0.954 |
| 0.35046728971962615 | 0.954 |
| 0.3509345794392523 | 0.954 |
| 0.3514018691588785 | 0.954 |
| 0.3518691588785047 | 0.954 |
| 0.35233644859813085 | 0.954 |
| 0.352803738317757 | 0.954 |
| 0.3532710280373832 | 0.954 |
| 0.35373831775700937 | 0.954 |
| 0.3542056074766355 | 0.954 |
| 0.35467289719626166 | 0.954 |
| 0.35514018691588783 | 0.954 |
| 0.355607476635514 | 0.954 |
| 0.3560747663551402 | 0.954 |
| 0.35654205607476636 | 0.954 |
| 0.35700934579439253 | 0.954 |
| 0.3574766355140187 | 0.954 |
| 0.3579439252336449 | 0.954 |
| 0.35841121495327105 | 0.954 |
| 0.35887850467289717 | 0.954 |
| 0.35887850467289717 | 0.958 |
| 0.35934579439252334 | 0.958 |
| 0.3598130841121495 | 0.958 |
| 0.3602803738317757 | 0.958 |
| 0.36074766355140186 | 0.958 |
| 0.36121495327102804 | 0.958 |
| 0.3616822429906542 | 0.958 |
| 0.3621495327102804 | 0.958 |
| 0.36261682242990656 | 0.958 |
| 0.36308411214953273 | 0.958 |
| 0.36355140186915885 | 0.958 |
| 0.364018691588785 | 0.958 |
| 0.3644859813084112 | 0.958 |
| 0.3649532710280374 | 0.958 |
| 0.36542056074766355 | 0.958 |
| 0.36542056074766355 | 0.961 |
| 0.3658878504672897 | 0.961 |
| 0.3663551401869159 | 0.961 |
| 0.36682242990654207 | 0.961 |
| 0.36728971962616824 | 0.961 |
| 0.3677570093457944 | 0.961 |
| 0.36822429906542054 | 0.961 |
| 0.3686915887850467 | 0.961 |
| 0.3691588785046729 | 0.961 |
| 0.36962616822429906 | 0.961 |
| 0.37009345794392523 | 0.961 |
| 0.3705607476635514 | 0.961 |
| 0.3710280373831776 | 0.961 |
| 0.3710280373831776 | 0.964 |
| 0.3710280373831776 | 0.967 |
| 0.37149532710280375 | 0.967 |
| 0.3719626168224299 | 0.967 |
| 0.3724299065420561 | 0.967 |
| 0.3728971962616822 | 0.967 |
| 0.3733644859813084 | 0.967 |
| 0.37383177570093457 | 0.967 |
| 0.37429906542056074 | 0.967 |
| 0.3747663551401869 | 0.967 |
| 0.3752336448598131 | 0.967 |
| 0.37570093457943926 | 0.967 |
| 0.37616822429906543 | 0.967 |
| 0.3766355140186916 | 0.967 |
| 0.3771028037383178 | 0.967 |
| 0.3775700934579439 | 0.967 |
| 0.3780373831775701 | 0.967 |
| 0.37850467289719625 | 0.967 |
| 0.3789719626168224 | 0.967 |
| 0.3794392523364486 | 0.967 |
| 0.37990654205607477 | 0.967 |
| 0.38037383177570094 | 0.967 |
| 0.3808411214953271 | 0.967 |
| 0.3813084112149533 | 0.967 |
| 0.38177570093457946 | 0.967 |
| 0.3822429906542056 | 0.967 |
| 0.38271028037383176 | 0.967 |
| 0.38317757009345793 | 0.967 |
| 0.3836448598130841 | 0.967 |
| 0.3841121495327103 | 0.967 |
| 0.38457943925233645 | 0.967 |
| 0.3850467289719626 | 0.967 |
| 0.3855140186915888 | 0.967 |
| 0.385981308411215 | 0.967 |
| 0.38644859813084115 | 0.967 |
| 0.38691588785046727 | 0.967 |
| 0.38738317757009344 | 0.967 |
| 0.3878504672897196 | 0.967 |
| 0.3883177570093458 | 0.967 |
| 0.38878504672897196 | 0.967 |
| 0.38925233644859814 | 0.967 |
| 0.38925233644859814 | 0.971 |
| 0.3897196261682243 | 0.971 |
| 0.3901869158878505 | 0.971 |
| 0.39065420560747666 | 0.971 |
| 0.39112149532710283 | 0.971 |
| 0.39158878504672895 | 0.971 |
| 0.3920560747663551 | 0.971 |
| 0.3925233644859813 | 0.971 |
| 0.3925233644859813 | 0.974 |
| 0.39299065420560747 | 0.974 |
| 0.39345794392523364 | 0.974 |
| 0.3939252336448598 | 0.974 |
| 0.394392523364486 | 0.974 |
| 0.39485981308411217 | 0.974 |
| 0.39532710280373834 | 0.974 |
| 0.3957943925233645 | 0.974 |
| 0.39626168224299063 | 0.974 |
| 0.3967289719626168 | 0.974 |
| 0.397196261682243 | 0.974 |
| 0.39766355140186915 | 0.974 |
| 0.3981308411214953 | 0.974 |
| 0.3985981308411215 | 0.974 |
| 0.3990654205607477 | 0.974 |
| 0.39953271028037385 | 0.974 |
| 0.4 | 0.974 |
| 0.40046728971962614 | 0.974 |
| 0.4009345794392523 | 0.974 |
| 0.4014018691588785 | 0.974 |
| 0.40186915887850466 | 0.974 |
| 0.40233644859813084 | 0.974 |
| 0.402803738317757 | 0.974 |
| 0.4032710280373832 | 0.974 |
| 0.4032710280373832 | 0.977 |
| 0.40373831775700936 | 0.977 |
| 0.40420560747663553 | 0.977 |
| 0.4046728971962617 | 0.977 |
| 0.4051401869158878 | 0.977 |
| 0.405607476635514 | 0.977 |
| 0.40607476635514017 | 0.977 |
| 0.40654205607476634 | 0.977 |
| 0.4070093457943925 | 0.977 |
| 0.4074766355140187 | 0.977 |
| 0.40794392523364487 | 0.977 |
| 0.40841121495327104 | 0.977 |
| 0.4088785046728972 | 0.977 |
| 0.4093457943925234 | 0.977 |
| 0.4098130841121495 | 0.977 |
| 0.4098130841121495 | 0.98 |
| 0.4102803738317757 | 0.98 |
| 0.41074766355140185 | 0.98 |
| 0.411214953271028 | 0.98 |
| 0.4116822429906542 | 0.98 |
| 0.4121495327102804 | 0.98 |
| 0.41261682242990655 | 0.98 |
| 0.4130841121495327 | 0.98 |
| 0.4135514018691589 | 0.98 |
| 0.41401869158878507 | 0.98 |
| 0.4144859813084112 | 0.98 |
| 0.41495327102803736 | 0.98 |
| 0.41542056074766354 | 0.98 |
| 0.4158878504672897 | 0.98 |
| 0.4158878504672897 | 0.984 |
| 0.4163551401869159 | 0.984 |
| 0.41682242990654206 | 0.984 |
| 0.41682242990654206 | 0.987 |
| 0.41728971962616823 | 0.987 |
| 0.4177570093457944 | 0.987 |
| 0.4182242990654206 | 0.987 |
| 0.41869158878504675 | 0.987 |
| 0.41915887850467287 | 0.987 |
| 0.41962616822429905 | 0.987 |
| 0.4200934579439252 | 0.987 |
| 0.4205607476635514 | 0.987 |
| 0.42102803738317757 | 0.987 |
| 0.42149532710280374 | 0.987 |
| 0.4219626168224299 | 0.987 |
| 0.4224299065420561 | 0.987 |
| 0.42289719626168226 | 0.987 |
| 0.42336448598130844 | 0.987 |
| 0.42383177570093455 | 0.987 |
| 0.42429906542056073 | 0.987 |
| 0.4247663551401869 | 0.987 |
| 0.4252336448598131 | 0.987 |
| 0.42570093457943925 | 0.987 |
| 0.4261682242990654 | 0.987 |
| 0.4266355140186916 | 0.987 |
| 0.42710280373831777 | 0.987 |
| 0.42757009345794394 | 0.987 |
| 0.4280373831775701 | 0.987 |
| 0.42850467289719624 | 0.987 |
| 0.4289719626168224 | 0.987 |
| 0.4294392523364486 | 0.987 |
| 0.42990654205607476 | 0.987 |
| 0.43037383177570093 | 0.987 |
| 0.4308411214953271 | 0.987 |
| 0.4313084112149533 | 0.987 |
| 0.43177570093457945 | 0.987 |
| 0.4322429906542056 | 0.987 |
| 0.4327102803738318 | 0.987 |
| 0.4331775700934579 | 0.987 |
| 0.4336448598130841 | 0.987 |
| 0.43411214953271027 | 0.987 |
| 0.43457943925233644 | 0.987 |
| 0.4350467289719626 | 0.987 |
| 0.4355140186915888 | 0.987 |
| 0.43598130841121496 | 0.987 |
| 0.43644859813084114 | 0.987 |
| 0.4369158878504673 | 0.987 |
| 0.4373831775700935 | 0.987 |
| 0.4373831775700935 | 0.99 |
| 0.4378504672897196 | 0.99 |
| 0.4383177570093458 | 0.99 |
| 0.43878504672897195 | 0.99 |
| 0.4392523364485981 | 0.99 |
| 0.4397196261682243 | 0.99 |
| 0.44018691588785047 | 0.99 |
| 0.44065420560747665 | 0.99 |
| 0.4411214953271028 | 0.99 |
| 0.441588785046729 | 0.99 |
| 0.44205607476635517 | 0.99 |
| 0.4425233644859813 | 0.99 |
| 0.44299065420560746 | 0.99 |
| 0.44345794392523363 | 0.99 |
| 0.4439252336448598 | 0.99 |
| 0.444392523364486 | 0.99 |
| 0.44485981308411215 | 0.99 |
| 0.44532710280373833 | 0.99 |
| 0.4457943925233645 | 0.99 |
| 0.4462616822429907 | 0.99 |
| 0.44672897196261685 | 0.99 |
| 0.44719626168224297 | 0.99 |
| 0.44766355140186914 | 0.99 |
| 0.4481308411214953 | 0.99 |
| 0.4485981308411215 | 0.99 |
| 0.44906542056074766 | 0.99 |
| 0.44953271028037384 | 0.99 |
| 0.45 | 0.99 |
| 0.4504672897196262 | 0.99 |
| 0.45093457943925236 | 0.99 |
| 0.4514018691588785 | 0.99 |
| 0.45186915887850465 | 0.99 |
| 0.4523364485981308 | 0.99 |
| 0.452803738317757 | 0.99 |
| 0.4532710280373832 | 0.99 |
| 0.45373831775700935 | 0.99 |
| 0.4542056074766355 | 0.99 |
| 0.4546728971962617 | 0.99 |
| 0.45514018691588787 | 0.99 |
| 0.45560747663551404 | 0.99 |
| 0.45607476635514016 | 0.99 |
| 0.45654205607476633 | 0.99 |
| 0.4570093457943925 | 0.99 |
| 0.4574766355140187 | 0.99 |
| 0.45794392523364486 | 0.99 |
| 0.45841121495327103 | 0.99 |
| 0.4588785046728972 | 0.99 |
| 0.4593457943925234 | 0.99 |
| 0.45981308411214955 | 0.99 |
| 0.4602803738317757 | 0.99 |
| 0.46074766355140184 | 0.99 |
| 0.461214953271028 | 0.99 |
| 0.4616822429906542 | 0.99 |
| 0.46214953271028036 | 0.99 |
| 0.46261682242990654 | 0.99 |
| 0.4630841121495327 | 0.99 |
| 0.4635514018691589 | 0.99 |
| 0.46401869158878506 | 0.99 |
| 0.46448598130841123 | 0.99 |
| 0.4649532710280374 | 0.99 |
| 0.4654205607476635 | 0.99 |
| 0.4658878504672897 | 0.99 |
| 0.4663551401869159 | 0.99 |
| 0.46682242990654205 | 0.99 |
| 0.4672897196261682 | 0.99 |
| 0.4677570093457944 | 0.99 |
| 0.46822429906542057 | 0.99 |
| 0.46869158878504674 | 0.99 |
| 0.4691588785046729 | 0.99 |
| 0.4696261682242991 | 0.99 |
| 0.4700934579439252 | 0.99 |
| 0.4705607476635514 | 0.99 |
| 0.47102803738317756 | 0.99 |
| 0.47149532710280373 | 0.99 |
| 0.4719626168224299 | 0.99 |
| 0.4724299065420561 | 0.99 |
| 0.47289719626168225 | 0.99 |
| 0.4733644859813084 | 0.99 |
| 0.4738317757009346 | 0.99 |
| 0.4738317757009346 | 0.993 |
| 0.4742990654205608 | 0.993 |
| 0.4747663551401869 | 0.993 |
| 0.47523364485981306 | 0.993 |
| 0.47570093457943924 | 0.993 |
| 0.4761682242990654 | 0.993 |
| 0.4766355140186916 | 0.993 |
| 0.47710280373831776 | 0.993 |
| 0.47757009345794393 | 0.993 |
| 0.4780373831775701 | 0.993 |
| 0.4785046728971963 | 0.993 |
| 0.47897196261682246 | 0.993 |
| 0.4794392523364486 | 0.993 |
| 0.47990654205607475 | 0.993 |
| 0.4803738317757009 | 0.993 |
| 0.4808411214953271 | 0.993 |
| 0.48130841121495327 | 0.993 |
| 0.48177570093457944 | 0.993 |
| 0.4822429906542056 | 0.993 |
| 0.4827102803738318 | 0.993 |
| 0.48317757009345796 | 0.993 |
| 0.48364485981308414 | 0.993 |
| 0.48411214953271026 | 0.993 |
| 0.48457943925233643 | 0.993 |
| 0.4850467289719626 | 0.993 |
| 0.4855140186915888 | 0.993 |
| 0.48598130841121495 | 0.993 |
| 0.4864485981308411 | 0.993 |
| 0.4869158878504673 | 0.993 |
| 0.4873831775700935 | 0.993 |
| 0.48785046728971965 | 0.993 |
| 0.4883177570093458 | 0.993 |
| 0.48878504672897194 | 0.993 |
| 0.4892523364485981 | 0.993 |
| 0.4897196261682243 | 0.993 |
| 0.49018691588785046 | 0.993 |
| 0.49065420560747663 | 0.993 |
| 0.4911214953271028 | 0.993 |
| 0.491588785046729 | 0.993 |
| 0.49205607476635516 | 0.993 |
| 0.49252336448598133 | 0.993 |
| 0.4929906542056075 | 0.993 |
| 0.4934579439252336 | 0.993 |
| 0.4939252336448598 | 0.993 |
| 0.49439252336448597 | 0.993 |
| 0.49485981308411214 | 0.993 |
| 0.4953271028037383 | 0.993 |
| 0.4957943925233645 | 0.993 |
| 0.49626168224299066 | 0.993 |
| 0.49672897196261684 | 0.993 |
| 0.497196261682243 | 0.993 |
| 0.4976635514018692 | 0.993 |
| 0.4981308411214953 | 0.993 |
| 0.4985981308411215 | 0.993 |
| 0.49906542056074765 | 0.993 |
| 0.4995327102803738 | 0.993 |
| 0.5 | 0.993 |
| 0.5004672897196262 | 0.993 |
| 0.5009345794392523 | 0.993 |
| 0.5014018691588785 | 0.993 |
| 0.5018691588785047 | 0.993 |
| 0.5023364485981309 | 0.993 |
| 0.502803738317757 | 0.993 |
| 0.5032710280373832 | 0.993 |
| 0.5037383177570094 | 0.993 |
| 0.5042056074766356 | 0.993 |
| 0.5046728971962616 | 0.993 |
| 0.5051401869158878 | 0.993 |
| 0.505607476635514 | 0.993 |
| 0.5060747663551401 | 0.993 |
| 0.5065420560747663 | 0.993 |
| 0.5070093457943925 | 0.993 |
| 0.5074766355140187 | 0.993 |
| 0.5079439252336448 | 0.993 |
| 0.508411214953271 | 0.993 |
| 0.5088785046728972 | 0.993 |
| 0.5093457943925234 | 0.993 |
| 0.5098130841121495 | 0.993 |
| 0.5102803738317757 | 0.993 |
| 0.5107476635514019 | 0.993 |
| 0.5112149532710281 | 0.993 |
| 0.5116822429906542 | 0.993 |
| 0.5121495327102804 | 0.993 |
| 0.5126168224299066 | 0.993 |
| 0.5130841121495328 | 0.993 |
| 0.5135514018691589 | 0.993 |
| 0.514018691588785 | 0.993 |
| 0.5144859813084112 | 0.993 |
| 0.5149532710280373 | 0.993 |
| 0.5154205607476635 | 0.993 |
| 0.5158878504672897 | 0.993 |
| 0.5163551401869159 | 0.993 |
| 0.516822429906542 | 0.993 |
| 0.5172897196261682 | 0.993 |
| 0.5177570093457944 | 0.993 |
| 0.5182242990654206 | 0.993 |
| 0.5186915887850467 | 0.993 |
| 0.5191588785046729 | 0.993 |
| 0.5196261682242991 | 0.993 |
| 0.5200934579439253 | 0.993 |
| 0.5205607476635514 | 0.993 |
| 0.5210280373831776 | 0.993 |
| 0.5214953271028038 | 0.993 |
| 0.52196261682243 | 0.993 |
| 0.5224299065420561 | 0.993 |
| 0.5228971962616823 | 0.993 |
| 0.5233644859813084 | 0.993 |
| 0.5238317757009345 | 0.993 |
| 0.5242990654205607 | 0.993 |
| 0.5247663551401869 | 0.993 |
| 0.525233644859813 | 0.993 |
| 0.5257009345794392 | 0.993 |
| 0.5261682242990654 | 0.993 |
| 0.5266355140186916 | 0.993 |
| 0.5271028037383177 | 0.993 |
| 0.5275700934579439 | 0.993 |
| 0.5280373831775701 | 0.993 |
| 0.5285046728971963 | 0.993 |
| 0.5289719626168224 | 0.993 |
| 0.5294392523364486 | 0.993 |
| 0.5299065420560748 | 0.993 |
| 0.530373831775701 | 0.993 |
| 0.5308411214953271 | 0.993 |
| 0.5313084112149533 | 0.993 |
| 0.5317757009345795 | 0.993 |
| 0.5322429906542057 | 0.993 |
| 0.5327102803738317 | 0.993 |
| 0.5331775700934579 | 0.993 |
| 0.5336448598130841 | 0.993 |
| 0.5341121495327102 | 0.993 |
| 0.5345794392523364 | 0.993 |
| 0.5350467289719626 | 0.993 |
| 0.5355140186915888 | 0.993 |
| 0.5359813084112149 | 0.993 |
| 0.5364485981308411 | 0.993 |
| 0.5369158878504673 | 0.993 |
| 0.5373831775700935 | 0.993 |
| 0.5378504672897196 | 0.993 |
| 0.5383177570093458 | 0.993 |
| 0.538785046728972 | 0.993 |
| 0.5392523364485982 | 0.993 |
| 0.5397196261682243 | 0.993 |
| 0.5401869158878505 | 0.993 |
| 0.5406542056074767 | 0.993 |
| 0.5411214953271029 | 0.993 |
| 0.541588785046729 | 0.993 |
| 0.5420560747663551 | 0.993 |
| 0.5425233644859813 | 0.993 |
| 0.5429906542056074 | 0.993 |
| 0.5434579439252336 | 0.993 |
| 0.5439252336448598 | 0.993 |
| 0.544392523364486 | 0.993 |
| 0.5448598130841121 | 0.993 |
| 0.5453271028037383 | 0.993 |
| 0.5457943925233645 | 0.993 |
| 0.5462616822429907 | 0.993 |
| 0.5467289719626168 | 0.993 |
| 0.547196261682243 | 0.993 |
| 0.5476635514018692 | 0.993 |
| 0.5481308411214953 | 0.993 |
| 0.5485981308411215 | 0.993 |
| 0.5490654205607477 | 0.993 |
| 0.5495327102803739 | 0.993 |
| 0.55 | 0.993 |
| 0.5504672897196262 | 0.993 |
| 0.5509345794392523 | 0.993 |
| 0.5514018691588785 | 0.993 |
| 0.5518691588785046 | 0.993 |
| 0.5523364485981308 | 0.993 |
| 0.552803738317757 | 0.993 |
| 0.5532710280373832 | 0.993 |
| 0.5537383177570093 | 0.993 |
| 0.5542056074766355 | 0.993 |
| 0.5546728971962617 | 0.993 |
| 0.5551401869158878 | 0.993 |
| 0.555607476635514 | 0.993 |
| 0.5560747663551402 | 0.993 |
| 0.5565420560747664 | 0.993 |
| 0.5570093457943925 | 0.993 |
| 0.5574766355140187 | 0.993 |
| 0.5579439252336449 | 0.993 |
| 0.5584112149532711 | 0.993 |
| 0.5588785046728972 | 0.993 |
| 0.5593457943925234 | 0.993 |
| 0.5598130841121496 | 0.993 |
| 0.5602803738317756 | 0.993 |
| 0.5607476635514018 | 0.993 |
| 0.561214953271028 | 0.993 |
| 0.5616822429906542 | 0.993 |
| 0.5621495327102803 | 0.993 |
| 0.5626168224299065 | 0.993 |
| 0.5630841121495327 | 0.993 |
| 0.5635514018691589 | 0.993 |
| 0.564018691588785 | 0.993 |
| 0.5644859813084112 | 0.993 |
| 0.5649532710280374 | 0.993 |
| 0.5654205607476636 | 0.993 |
| 0.5658878504672897 | 0.993 |
| 0.5663551401869159 | 0.993 |
| 0.5668224299065421 | 0.993 |
| 0.5672897196261683 | 0.993 |
| 0.5677570093457944 | 0.993 |
| 0.5682242990654206 | 0.993 |
| 0.5686915887850468 | 0.993 |
| 0.569158878504673 | 0.993 |
| 0.569626168224299 | 0.993 |
| 0.5700934579439252 | 0.993 |
| 0.5705607476635514 | 0.993 |
| 0.5710280373831775 | 0.993 |
| 0.5714953271028037 | 0.993 |
| 0.5719626168224299 | 0.993 |
| 0.572429906542056 | 0.993 |
| 0.5728971962616822 | 0.993 |
| 0.5733644859813084 | 0.993 |
| 0.5738317757009346 | 0.993 |
| 0.5742990654205608 | 0.993 |
| 0.5747663551401869 | 0.993 |
| 0.5752336448598131 | 0.993 |
| 0.5757009345794393 | 0.993 |
| 0.5761682242990654 | 0.993 |
| 0.5766355140186916 | 0.993 |
| 0.5771028037383178 | 0.993 |
| 0.577570093457944 | 0.993 |
| 0.5780373831775701 | 0.993 |
| 0.5785046728971963 | 0.993 |
| 0.5789719626168224 | 0.993 |
| 0.5794392523364486 | 0.993 |
| 0.5799065420560747 | 0.993 |
| 0.5803738317757009 | 0.993 |
| 0.5808411214953271 | 0.993 |
| 0.5813084112149532 | 0.993 |
| 0.5817757009345794 | 0.993 |
| 0.5822429906542056 | 0.993 |
| 0.5827102803738318 | 0.993 |
| 0.5831775700934579 | 0.993 |
| 0.5836448598130841 | 0.993 |
| 0.5841121495327103 | 0.993 |
| 0.5845794392523365 | 0.993 |
| 0.5850467289719626 | 0.993 |
| 0.5855140186915888 | 0.993 |
| 0.585981308411215 | 0.993 |
| 0.5864485981308412 | 0.993 |
| 0.5869158878504673 | 0.993 |
| 0.5873831775700935 | 0.993 |
| 0.5878504672897197 | 0.993 |
| 0.5883177570093457 | 0.993 |
| 0.5887850467289719 | 0.993 |
| 0.5892523364485981 | 0.993 |
| 0.5897196261682243 | 0.993 |
| 0.5901869158878504 | 0.993 |
| 0.5906542056074766 | 0.993 |
| 0.5911214953271028 | 0.993 |
| 0.591588785046729 | 0.993 |
| 0.5920560747663551 | 0.993 |
| 0.5925233644859813 | 0.993 |
| 0.5929906542056075 | 0.993 |
| 0.5934579439252337 | 0.993 |
| 0.5939252336448598 | 0.993 |
| 0.594392523364486 | 0.993 |
| 0.5948598130841122 | 0.993 |
| 0.5953271028037384 | 0.993 |
| 0.5957943925233645 | 0.993 |
| 0.5962616822429907 | 0.993 |
| 0.5967289719626169 | 0.993 |
| 0.597196261682243 | 0.993 |
| 0.5976635514018691 | 0.993 |
| 0.5981308411214953 | 0.993 |
| 0.5985981308411215 | 0.993 |
| 0.5990654205607476 | 0.993 |
| 0.5995327102803738 | 0.993 |
| 0.6 | 0.993 |
| 0.6004672897196262 | 0.993 |
| 0.6009345794392523 | 0.993 |
| 0.6014018691588785 | 0.993 |
| 0.6018691588785047 | 0.993 |
| 0.6023364485981308 | 0.993 |
| 0.602803738317757 | 0.993 |
| 0.6032710280373832 | 0.993 |
| 0.6037383177570094 | 0.993 |
| 0.6042056074766355 | 0.993 |
| 0.6046728971962617 | 0.993 |
| 0.6051401869158879 | 0.993 |
| 0.6056074766355141 | 0.993 |
| 0.6060747663551402 | 0.993 |
| 0.6065420560747663 | 0.993 |
| 0.6070093457943925 | 0.993 |
| 0.6074766355140186 | 0.993 |
| 0.6079439252336448 | 0.993 |
| 0.608411214953271 | 0.993 |
| 0.6088785046728972 | 0.993 |
| 0.6093457943925233 | 0.993 |
| 0.6098130841121495 | 0.993 |
| 0.6102803738317757 | 0.993 |
| 0.6107476635514019 | 0.993 |
| 0.611214953271028 | 0.993 |
| 0.6116822429906542 | 0.993 |
| 0.6121495327102804 | 0.993 |
| 0.6126168224299066 | 0.993 |
| 0.6130841121495327 | 0.993 |
| 0.6135514018691589 | 0.993 |
| 0.6140186915887851 | 0.993 |
| 0.6144859813084113 | 0.993 |
| 0.6149532710280374 | 0.993 |
| 0.6154205607476636 | 0.993 |
| 0.6158878504672897 | 0.993 |
| 0.6163551401869158 | 0.993 |
| 0.616822429906542 | 0.993 |
| 0.6172897196261682 | 0.993 |
| 0.6177570093457944 | 0.993 |
| 0.6182242990654205 | 0.993 |
| 0.6186915887850467 | 0.993 |
| 0.6191588785046729 | 0.993 |
| 0.6196261682242991 | 0.993 |
| 0.6200934579439252 | 0.993 |
| 0.6205607476635514 | 0.993 |
| 0.6210280373831776 | 0.993 |
| 0.6214953271028038 | 0.993 |
| 0.6219626168224299 | 0.993 |
| 0.6224299065420561 | 0.993 |
| 0.6228971962616823 | 0.993 |
| 0.6233644859813084 | 0.993 |
| 0.6238317757009346 | 0.993 |
| 0.6242990654205608 | 0.993 |
| 0.624766355140187 | 0.993 |
| 0.625233644859813 | 0.993 |
| 0.6257009345794392 | 0.993 |
| 0.6261682242990654 | 0.993 |
| 0.6266355140186916 | 0.993 |
| 0.6271028037383177 | 0.993 |
| 0.6275700934579439 | 0.993 |
| 0.6280373831775701 | 0.993 |
| 0.6285046728971962 | 0.993 |
| 0.6289719626168224 | 0.993 |
| 0.6294392523364486 | 0.993 |
| 0.6299065420560748 | 0.993 |
| 0.6303738317757009 | 0.993 |
| 0.6308411214953271 | 0.993 |
| 0.6313084112149533 | 0.993 |
| 0.6317757009345795 | 0.993 |
| 0.6322429906542056 | 0.993 |
| 0.6327102803738318 | 0.993 |
| 0.633177570093458 | 0.993 |
| 0.6336448598130842 | 0.993 |
| 0.6341121495327103 | 0.993 |
| 0.6345794392523364 | 0.993 |
| 0.6350467289719626 | 0.993 |
| 0.6355140186915887 | 0.993 |
| 0.6359813084112149 | 0.993 |
| 0.6364485981308411 | 0.993 |
| 0.6369158878504673 | 0.993 |
| 0.6373831775700934 | 0.993 |
| 0.6378504672897196 | 0.993 |
| 0.6383177570093458 | 0.993 |
| 0.638785046728972 | 0.993 |
| 0.6392523364485981 | 0.993 |
| 0.6397196261682243 | 0.993 |
| 0.6401869158878505 | 0.993 |
| 0.6406542056074767 | 0.993 |
| 0.6411214953271028 | 0.993 |
| 0.641588785046729 | 0.993 |
| 0.6420560747663552 | 0.993 |
| 0.6425233644859814 | 0.993 |
| 0.6429906542056075 | 0.993 |
| 0.6434579439252337 | 0.993 |
| 0.6439252336448598 | 0.993 |
| 0.6443925233644859 | 0.993 |
| 0.6448598130841121 | 0.993 |
| 0.6453271028037383 | 0.993 |
| 0.6457943925233645 | 0.993 |
| 0.6462616822429906 | 0.993 |
| 0.6467289719626168 | 0.993 |
| 0.647196261682243 | 0.993 |
| 0.6476635514018692 | 0.993 |
| 0.6481308411214953 | 0.993 |
| 0.6485981308411215 | 0.993 |
| 0.6490654205607477 | 0.993 |
| 0.6495327102803738 | 0.993 |
| 0.65 | 0.993 |
| 0.6504672897196262 | 0.993 |
| 0.6509345794392524 | 0.993 |
| 0.6514018691588785 | 0.993 |
| 0.6514018691588785 | 0.997 |
| 0.6518691588785047 | 0.997 |
| 0.6523364485981309 | 0.997 |
| 0.652803738317757 | 0.997 |
| 0.6532710280373831 | 0.997 |
| 0.6537383177570093 | 0.997 |
| 0.6542056074766355 | 0.997 |
| 0.6546728971962616 | 0.997 |
| 0.6551401869158878 | 0.997 |
| 0.655607476635514 | 0.997 |
| 0.6560747663551402 | 0.997 |
| 0.6565420560747663 | 0.997 |
| 0.6570093457943925 | 0.997 |
| 0.6574766355140187 | 0.997 |
| 0.6579439252336449 | 0.997 |
| 0.658411214953271 | 0.997 |
| 0.6588785046728972 | 0.997 |
| 0.6593457943925234 | 0.997 |
| 0.6598130841121496 | 0.997 |
| 0.6602803738317757 | 0.997 |
| 0.6607476635514019 | 0.997 |
| 0.6612149532710281 | 0.997 |
| 0.6616822429906543 | 0.997 |
| 0.6621495327102803 | 0.997 |
| 0.6626168224299065 | 0.997 |
| 0.6630841121495327 | 0.997 |
| 0.6635514018691588 | 0.997 |
| 0.664018691588785 | 0.997 |
| 0.6644859813084112 | 0.997 |
| 0.6649532710280374 | 0.997 |
| 0.6654205607476635 | 0.997 |
| 0.6658878504672897 | 0.997 |
| 0.6663551401869159 | 0.997 |
| 0.6668224299065421 | 0.997 |
| 0.6672897196261682 | 0.997 |
| 0.6677570093457944 | 0.997 |
| 0.6682242990654206 | 0.997 |
| 0.6686915887850468 | 0.997 |
| 0.6691588785046729 | 0.997 |
| 0.6696261682242991 | 0.997 |
| 0.6700934579439253 | 0.997 |
| 0.6705607476635514 | 0.997 |
| 0.6710280373831776 | 0.997 |
| 0.6714953271028037 | 0.997 |
| 0.6719626168224299 | 0.997 |
| 0.672429906542056 | 0.997 |
| 0.6728971962616822 | 0.997 |
| 0.6733644859813084 | 0.997 |
| 0.6738317757009346 | 0.997 |
| 0.6742990654205607 | 0.997 |
| 0.6747663551401869 | 0.997 |
| 0.6752336448598131 | 0.997 |
| 0.6757009345794392 | 0.997 |
| 0.6761682242990654 | 0.997 |
| 0.6766355140186916 | 0.997 |
| 0.6771028037383178 | 0.997 |
| 0.677570093457944 | 0.997 |
| 0.6780373831775701 | 0.997 |
| 0.6785046728971963 | 0.997 |
| 0.6789719626168225 | 0.997 |
| 0.6794392523364486 | 0.997 |
| 0.6799065420560748 | 0.997 |
| 0.680373831775701 | 0.997 |
| 0.680841121495327 | 0.997 |
| 0.6813084112149532 | 0.997 |
| 0.6817757009345794 | 0.997 |
| 0.6822429906542056 | 0.997 |
| 0.6827102803738317 | 0.997 |
| 0.6831775700934579 | 0.997 |
| 0.6836448598130841 | 0.997 |
| 0.6841121495327103 | 0.997 |
| 0.6845794392523364 | 0.997 |
| 0.6850467289719626 | 0.997 |
| 0.6855140186915888 | 0.997 |
| 0.685981308411215 | 0.997 |
| 0.6864485981308411 | 0.997 |
| 0.6869158878504673 | 0.997 |
| 0.6873831775700935 | 0.997 |
| 0.6878504672897197 | 0.997 |
| 0.6883177570093458 | 0.997 |
| 0.688785046728972 | 0.997 |
| 0.6892523364485982 | 0.997 |
| 0.6897196261682244 | 0.997 |
| 0.6901869158878504 | 0.997 |
| 0.6906542056074766 | 0.997 |
| 0.6911214953271028 | 0.997 |
| 0.6915887850467289 | 0.997 |
| 0.6920560747663551 | 0.997 |
| 0.6925233644859813 | 0.997 |
| 0.6929906542056075 | 0.997 |
| 0.6934579439252336 | 0.997 |
| 0.6939252336448598 | 0.997 |
| 0.694392523364486 | 0.997 |
| 0.6948598130841122 | 0.997 |
| 0.6953271028037383 | 0.997 |
| 0.6957943925233645 | 0.997 |
| 0.6962616822429907 | 0.997 |
| 0.6967289719626168 | 0.997 |
| 0.697196261682243 | 0.997 |
| 0.6976635514018692 | 0.997 |
| 0.6981308411214954 | 0.997 |
| 0.6985981308411215 | 0.997 |
| 0.6990654205607477 | 0.997 |
| 0.6995327102803738 | 0.997 |
| 0.7 | 0.997 |
| 0.7004672897196261 | 0.997 |
| 0.7009345794392523 | 0.997 |
| 0.7014018691588785 | 0.997 |
| 0.7018691588785047 | 0.997 |
| 0.7023364485981308 | 0.997 |
| 0.702803738317757 | 0.997 |
| 0.7032710280373832 | 0.997 |
| 0.7037383177570093 | 0.997 |
| 0.7042056074766355 | 0.997 |
| 0.7046728971962617 | 0.997 |
| 0.7051401869158879 | 0.997 |
| 0.705607476635514 | 0.997 |
| 0.7060747663551402 | 0.997 |
| 0.7065420560747664 | 0.997 |
| 0.7070093457943926 | 0.997 |
| 0.7074766355140187 | 0.997 |
| 0.7079439252336449 | 0.997 |
| 0.708411214953271 | 0.997 |
| 0.7088785046728971 | 0.997 |
| 0.7093457943925233 | 0.997 |
| 0.7098130841121495 | 0.997 |
| 0.7102803738317757 | 0.997 |
| 0.7107476635514018 | 0.997 |
| 0.711214953271028 | 0.997 |
| 0.7116822429906542 | 0.997 |
| 0.7121495327102804 | 0.997 |
| 0.7126168224299065 | 0.997 |
| 0.7130841121495327 | 0.997 |
| 0.7135514018691589 | 0.997 |
| 0.7140186915887851 | 0.997 |
| 0.7144859813084112 | 0.997 |
| 0.7149532710280374 | 0.997 |
| 0.7154205607476636 | 0.997 |
| 0.7158878504672898 | 0.997 |
| 0.7163551401869159 | 0.997 |
| 0.7168224299065421 | 0.997 |
| 0.7172897196261683 | 0.997 |
| 0.7177570093457943 | 0.997 |
| 0.7182242990654205 | 0.997 |
| 0.7186915887850467 | 0.997 |
| 0.7191588785046729 | 0.997 |
| 0.719626168224299 | 0.997 |
| 0.7200934579439252 | 0.997 |
| 0.7205607476635514 | 0.997 |
| 0.7210280373831776 | 0.997 |
| 0.7214953271028037 | 0.997 |
| 0.7219626168224299 | 0.997 |
| 0.7224299065420561 | 0.997 |
| 0.7228971962616823 | 0.997 |
| 0.7233644859813084 | 0.997 |
| 0.7238317757009346 | 0.997 |
| 0.7242990654205608 | 0.997 |
| 0.724766355140187 | 0.997 |
| 0.7252336448598131 | 0.997 |
| 0.7257009345794393 | 0.997 |
| 0.7261682242990655 | 0.997 |
| 0.7266355140186916 | 0.997 |
| 0.7271028037383177 | 0.997 |
| 0.7275700934579439 | 0.997 |
| 0.72803738317757 | 0.997 |
| 0.7285046728971962 | 0.997 |
| 0.7289719626168224 | 0.997 |
| 0.7294392523364486 | 0.997 |
| 0.7299065420560747 | 0.997 |
| 0.7303738317757009 | 0.997 |
| 0.7308411214953271 | 0.997 |
| 0.7313084112149533 | 0.997 |
| 0.7317757009345794 | 0.997 |
| 0.7322429906542056 | 0.997 |
| 0.7327102803738318 | 0.997 |
| 0.733177570093458 | 0.997 |
| 0.7336448598130841 | 0.997 |
| 0.7341121495327103 | 0.997 |
| 0.7345794392523365 | 0.997 |
| 0.7350467289719627 | 0.997 |
| 0.7355140186915888 | 0.997 |
| 0.735981308411215 | 0.997 |
| 0.7364485981308411 | 0.997 |
| 0.7369158878504672 | 0.997 |
| 0.7373831775700934 | 0.997 |
| 0.7378504672897196 | 0.997 |
| 0.7383177570093458 | 0.997 |
| 0.7387850467289719 | 0.997 |
| 0.7392523364485981 | 0.997 |
| 0.7397196261682243 | 0.997 |
| 0.7401869158878505 | 0.997 |
| 0.7406542056074766 | 0.997 |
| 0.7411214953271028 | 0.997 |
| 0.741588785046729 | 0.997 |
| 0.7420560747663552 | 0.997 |
| 0.7425233644859813 | 0.997 |
| 0.7429906542056075 | 0.997 |
| 0.7434579439252337 | 0.997 |
| 0.7439252336448599 | 0.997 |
| 0.744392523364486 | 0.997 |
| 0.7448598130841122 | 0.997 |
| 0.7453271028037384 | 0.997 |
| 0.7457943925233644 | 0.997 |
| 0.7462616822429906 | 0.997 |
| 0.7467289719626168 | 0.997 |
| 0.747196261682243 | 0.997 |
| 0.7476635514018691 | 0.997 |
| 0.7481308411214953 | 0.997 |
| 0.7485981308411215 | 0.997 |
| 0.7490654205607477 | 0.997 |
| 0.7495327102803738 | 0.997 |
| 0.75 | 0.997 |
| 0.7504672897196262 | 0.997 |
| 0.7509345794392523 | 0.997 |
| 0.7514018691588785 | 0.997 |
| 0.7518691588785047 | 0.997 |
| 0.7523364485981309 | 0.997 |
| 0.752803738317757 | 0.997 |
| 0.7532710280373832 | 0.997 |
| 0.7537383177570094 | 0.997 |
| 0.7542056074766356 | 0.997 |
| 0.7546728971962616 | 0.997 |
| 0.7551401869158878 | 0.997 |
| 0.755607476635514 | 0.997 |
| 0.7560747663551401 | 0.997 |
| 0.7565420560747663 | 0.997 |
| 0.7570093457943925 | 0.997 |
| 0.7574766355140187 | 0.997 |
| 0.7579439252336448 | 0.997 |
| 0.758411214953271 | 0.997 |
| 0.7588785046728972 | 0.997 |
| 0.7593457943925234 | 0.997 |
| 0.7598130841121495 | 0.997 |
| 0.7602803738317757 | 0.997 |
| 0.7607476635514019 | 0.997 |
| 0.7612149532710281 | 0.997 |
| 0.7616822429906542 | 0.997 |
| 0.7621495327102804 | 0.997 |
| 0.7626168224299066 | 0.997 |
| 0.7630841121495328 | 0.997 |
| 0.7635514018691589 | 0.997 |
| 0.764018691588785 | 0.997 |
| 0.7644859813084112 | 0.997 |
| 0.7649532710280373 | 0.997 |
| 0.7654205607476635 | 0.997 |
| 0.7658878504672897 | 0.997 |
| 0.7663551401869159 | 0.997 |
| 0.766822429906542 | 0.997 |
| 0.7672897196261682 | 0.997 |
| 0.7677570093457944 | 0.997 |
| 0.7682242990654206 | 0.997 |
| 0.7686915887850467 | 0.997 |
| 0.7691588785046729 | 0.997 |
| 0.7696261682242991 | 0.997 |
| 0.7700934579439253 | 0.997 |
| 0.7705607476635514 | 0.997 |
| 0.7710280373831776 | 0.997 |
| 0.7714953271028038 | 0.997 |
| 0.77196261682243 | 0.997 |
| 0.7724299065420561 | 0.997 |
| 0.7728971962616823 | 0.997 |
| 0.7733644859813084 | 0.997 |
| 0.7738317757009345 | 0.997 |
| 0.7742990654205607 | 0.997 |
| 0.7747663551401869 | 0.997 |
| 0.775233644859813 | 0.997 |
| 0.7757009345794392 | 0.997 |
| 0.7761682242990654 | 0.997 |
| 0.7766355140186916 | 0.997 |
| 0.7771028037383177 | 0.997 |
| 0.7775700934579439 | 0.997 |
| 0.7780373831775701 | 0.997 |
| 0.7785046728971963 | 0.997 |
| 0.7789719626168224 | 0.997 |
| 0.7794392523364486 | 0.997 |
| 0.7799065420560748 | 0.997 |
| 0.780373831775701 | 0.997 |
| 0.7808411214953271 | 0.997 |
| 0.7813084112149533 | 0.997 |
| 0.7817757009345795 | 0.997 |
| 0.7822429906542057 | 0.997 |
| 0.7827102803738317 | 0.997 |
| 0.7831775700934579 | 0.997 |
| 0.7836448598130841 | 0.997 |
| 0.7841121495327102 | 0.997 |
| 0.7845794392523364 | 0.997 |
| 0.7850467289719626 | 0.997 |
| 0.7855140186915888 | 0.997 |
| 0.7859813084112149 | 0.997 |
| 0.7864485981308411 | 0.997 |
| 0.7869158878504673 | 0.997 |
| 0.7873831775700935 | 0.997 |
| 0.7878504672897196 | 0.997 |
| 0.7883177570093458 | 0.997 |
| 0.788785046728972 | 0.997 |
| 0.7892523364485982 | 0.997 |
| 0.7897196261682243 | 0.997 |
| 0.7901869158878505 | 0.997 |
| 0.7906542056074767 | 0.997 |
| 0.7911214953271029 | 0.997 |
| 0.791588785046729 | 0.997 |
| 0.7920560747663551 | 0.997 |
| 0.7925233644859813 | 0.997 |
| 0.7929906542056074 | 0.997 |
| 0.7934579439252336 | 0.997 |
| 0.7939252336448598 | 0.997 |
| 0.794392523364486 | 0.997 |
| 0.7948598130841121 | 0.997 |
| 0.7953271028037383 | 0.997 |
| 0.7957943925233645 | 0.997 |
| 0.7962616822429907 | 0.997 |
| 0.7967289719626168 | 0.997 |
| 0.797196261682243 | 0.997 |
| 0.7976635514018692 | 0.997 |
| 0.7981308411214953 | 0.997 |
| 0.7985981308411215 | 0.997 |
| 0.7990654205607477 | 0.997 |
| 0.7995327102803739 | 0.997 |
| 0.8 | 0.997 |
| 0.8004672897196262 | 0.997 |
| 0.8009345794392523 | 0.997 |
| 0.8014018691588785 | 0.997 |
| 0.8018691588785046 | 0.997 |
| 0.8023364485981308 | 0.997 |
| 0.802803738317757 | 0.997 |
| 0.8032710280373832 | 0.997 |
| 0.8037383177570093 | 0.997 |
| 0.8042056074766355 | 0.997 |
| 0.8046728971962617 | 0.997 |
| 0.8051401869158878 | 0.997 |
| 0.805607476635514 | 0.997 |
| 0.8060747663551402 | 0.997 |
| 0.8065420560747664 | 0.997 |
| 0.8070093457943925 | 0.997 |
| 0.8074766355140187 | 0.997 |
| 0.8079439252336449 | 0.997 |
| 0.8084112149532711 | 0.997 |
| 0.8088785046728972 | 0.997 |
| 0.8093457943925234 | 0.997 |
| 0.8098130841121496 | 0.997 |
| 0.8102803738317756 | 0.997 |
| 0.8107476635514018 | 0.997 |
| 0.811214953271028 | 0.997 |
| 0.8116822429906542 | 0.997 |
| 0.8121495327102803 | 0.997 |
| 0.8126168224299065 | 0.997 |
| 0.8130841121495327 | 0.997 |
| 0.8135514018691589 | 0.997 |
| 0.814018691588785 | 0.997 |
| 0.8144859813084112 | 0.997 |
| 0.8149532710280374 | 0.997 |
| 0.8154205607476636 | 0.997 |
| 0.8158878504672897 | 0.997 |
| 0.8163551401869159 | 0.997 |
| 0.8168224299065421 | 0.997 |
| 0.8172897196261683 | 0.997 |
| 0.8177570093457944 | 0.997 |
| 0.8182242990654206 | 0.997 |
| 0.8186915887850468 | 0.997 |
| 0.819158878504673 | 0.997 |
| 0.819626168224299 | 0.997 |
| 0.8200934579439252 | 0.997 |
| 0.8205607476635514 | 0.997 |
| 0.8210280373831775 | 0.997 |
| 0.8214953271028037 | 0.997 |
| 0.8219626168224299 | 0.997 |
| 0.822429906542056 | 0.997 |
| 0.8228971962616822 | 0.997 |
| 0.8233644859813084 | 0.997 |
| 0.8238317757009346 | 0.997 |
| 0.8242990654205608 | 0.997 |
| 0.8247663551401869 | 0.997 |
| 0.8252336448598131 | 0.997 |
| 0.8257009345794393 | 0.997 |
| 0.8261682242990654 | 0.997 |
| 0.8266355140186916 | 0.997 |
| 0.8271028037383178 | 0.997 |
| 0.827570093457944 | 0.997 |
| 0.8280373831775701 | 0.997 |
| 0.8285046728971963 | 0.997 |
| 0.8289719626168224 | 0.997 |
| 0.8294392523364486 | 0.997 |
| 0.8299065420560747 | 0.997 |
| 0.8303738317757009 | 0.997 |
| 0.8308411214953271 | 0.997 |
| 0.8313084112149532 | 0.997 |
| 0.8317757009345794 | 0.997 |
| 0.8322429906542056 | 0.997 |
| 0.8327102803738318 | 0.997 |
| 0.8331775700934579 | 0.997 |
| 0.8336448598130841 | 0.997 |
| 0.8341121495327103 | 0.997 |
| 0.8345794392523365 | 0.997 |
| 0.8350467289719626 | 0.997 |
| 0.8355140186915888 | 0.997 |
| 0.835981308411215 | 0.997 |
| 0.8364485981308412 | 0.997 |
| 0.8369158878504673 | 0.997 |
| 0.8373831775700935 | 0.997 |
| 0.8378504672897197 | 0.997 |
| 0.8383177570093457 | 0.997 |
| 0.8387850467289719 | 0.997 |
| 0.8392523364485981 | 0.997 |
| 0.8397196261682243 | 0.997 |
| 0.8401869158878504 | 0.997 |
| 0.8406542056074766 | 0.997 |
| 0.8411214953271028 | 0.997 |
| 0.841588785046729 | 0.997 |
| 0.8420560747663551 | 0.997 |
| 0.8425233644859813 | 0.997 |
| 0.8429906542056075 | 0.997 |
| 0.8434579439252337 | 0.997 |
| 0.8439252336448598 | 0.997 |
| 0.844392523364486 | 0.997 |
| 0.8448598130841122 | 0.997 |
| 0.8453271028037384 | 0.997 |
| 0.8457943925233645 | 0.997 |
| 0.8462616822429907 | 0.997 |
| 0.8467289719626169 | 0.997 |
| 0.847196261682243 | 0.997 |
| 0.8476635514018691 | 0.997 |
| 0.8481308411214953 | 0.997 |
| 0.8485981308411215 | 0.997 |
| 0.8490654205607476 | 0.997 |
| 0.8495327102803738 | 0.997 |
| 0.85 | 0.997 |
| 0.8504672897196262 | 0.997 |
| 0.8509345794392523 | 0.997 |
| 0.8514018691588785 | 0.997 |
| 0.8518691588785047 | 0.997 |
| 0.8523364485981308 | 0.997 |
| 0.852803738317757 | 0.997 |
| 0.8532710280373832 | 0.997 |
| 0.8537383177570094 | 0.997 |
| 0.8542056074766355 | 0.997 |
| 0.8546728971962617 | 0.997 |
| 0.8551401869158879 | 0.997 |
| 0.8556074766355141 | 0.997 |
| 0.8560747663551402 | 0.997 |
| 0.8565420560747663 | 0.997 |
| 0.8570093457943925 | 0.997 |
| 0.8574766355140186 | 0.997 |
| 0.8579439252336448 | 0.997 |
| 0.858411214953271 | 0.997 |
| 0.8588785046728972 | 0.997 |
| 0.8593457943925233 | 0.997 |
| 0.8593457943925233 | 1 |
| 0.8598130841121495 | 1 |
| 0.8602803738317757 | 1 |
| 0.8607476635514019 | 1 |
| 0.861214953271028 | 1 |
| 0.8616822429906542 | 1 |
| 0.8621495327102804 | 1 |
| 0.8626168224299066 | 1 |
| 0.8630841121495327 | 1 |
| 0.8635514018691589 | 1 |
| 0.8640186915887851 | 1 |
| 0.8644859813084113 | 1 |
| 0.8649532710280374 | 1 |
| 0.8654205607476636 | 1 |
| 0.8658878504672897 | 1 |
| 0.8663551401869158 | 1 |
| 0.866822429906542 | 1 |
| 0.8672897196261682 | 1 |
| 0.8677570093457944 | 1 |
| 0.8682242990654205 | 1 |
| 0.8686915887850467 | 1 |
| 0.8691588785046729 | 1 |
| 0.8696261682242991 | 1 |
| 0.8700934579439252 | 1 |
| 0.8705607476635514 | 1 |
| 0.8710280373831776 | 1 |
| 0.8714953271028038 | 1 |
| 0.8719626168224299 | 1 |
| 0.8724299065420561 | 1 |
| 0.8728971962616823 | 1 |
| 0.8733644859813084 | 1 |
| 0.8738317757009346 | 1 |
| 0.8742990654205608 | 1 |
| 0.874766355140187 | 1 |
| 0.875233644859813 | 1 |
| 0.8757009345794392 | 1 |
| 0.8761682242990654 | 1 |
| 0.8766355140186916 | 1 |
| 0.8771028037383177 | 1 |
| 0.8775700934579439 | 1 |
| 0.8780373831775701 | 1 |
| 0.8785046728971962 | 1 |
| 0.8789719626168224 | 1 |
| 0.8794392523364486 | 1 |
| 0.8799065420560748 | 1 |
| 0.8803738317757009 | 1 |
| 0.8808411214953271 | 1 |
| 0.8813084112149533 | 1 |
| 0.8817757009345795 | 1 |
| 0.8822429906542056 | 1 |
| 0.8827102803738318 | 1 |
| 0.883177570093458 | 1 |
| 0.8836448598130842 | 1 |
| 0.8841121495327103 | 1 |
| 0.8845794392523364 | 1 |
| 0.8850467289719626 | 1 |
| 0.8855140186915887 | 1 |
| 0.8859813084112149 | 1 |
| 0.8864485981308411 | 1 |
| 0.8869158878504673 | 1 |
| 0.8873831775700934 | 1 |
| 0.8878504672897196 | 1 |
| 0.8883177570093458 | 1 |
| 0.888785046728972 | 1 |
| 0.8892523364485981 | 1 |
| 0.8897196261682243 | 1 |
| 0.8901869158878505 | 1 |
| 0.8906542056074767 | 1 |
| 0.8911214953271028 | 1 |
| 0.891588785046729 | 1 |
| 0.8920560747663552 | 1 |
| 0.8925233644859814 | 1 |
| 0.8929906542056075 | 1 |
| 0.8934579439252337 | 1 |
| 0.8939252336448598 | 1 |
| 0.8943925233644859 | 1 |
| 0.8948598130841121 | 1 |
| 0.8953271028037383 | 1 |
| 0.8957943925233645 | 1 |
| 0.8962616822429906 | 1 |
| 0.8967289719626168 | 1 |
| 0.897196261682243 | 1 |
| 0.8976635514018692 | 1 |
| 0.8981308411214953 | 1 |
| 0.8985981308411215 | 1 |
| 0.8990654205607477 | 1 |
| 0.8995327102803738 | 1 |
| 0.9 | 1 |
| 0.9004672897196262 | 1 |
| 0.9009345794392524 | 1 |
| 0.9014018691588785 | 1 |
| 0.9018691588785047 | 1 |
| 0.9023364485981309 | 1 |
| 0.902803738317757 | 1 |
| 0.9032710280373831 | 1 |
| 0.9037383177570093 | 1 |
| 0.9042056074766355 | 1 |
| 0.9046728971962616 | 1 |
| 0.9051401869158878 | 1 |
| 0.905607476635514 | 1 |
| 0.9060747663551402 | 1 |
| 0.9065420560747663 | 1 |
| 0.9070093457943925 | 1 |
| 0.9074766355140187 | 1 |
| 0.9079439252336449 | 1 |
| 0.908411214953271 | 1 |
| 0.9088785046728972 | 1 |
| 0.9093457943925234 | 1 |
| 0.9098130841121496 | 1 |
| 0.9102803738317757 | 1 |
| 0.9107476635514019 | 1 |
| 0.9112149532710281 | 1 |
| 0.9116822429906543 | 1 |
| 0.9121495327102803 | 1 |
| 0.9126168224299065 | 1 |
| 0.9130841121495327 | 1 |
| 0.9135514018691588 | 1 |
| 0.914018691588785 | 1 |
| 0.9144859813084112 | 1 |
| 0.9149532710280374 | 1 |
| 0.9154205607476635 | 1 |
| 0.9158878504672897 | 1 |
| 0.9163551401869159 | 1 |
| 0.9168224299065421 | 1 |
| 0.9172897196261682 | 1 |
| 0.9177570093457944 | 1 |
| 0.9182242990654206 | 1 |
| 0.9186915887850468 | 1 |
| 0.9191588785046729 | 1 |
| 0.9196261682242991 | 1 |
| 0.9200934579439253 | 1 |
| 0.9205607476635514 | 1 |
| 0.9210280373831776 | 1 |
| 0.9214953271028037 | 1 |
| 0.9219626168224299 | 1 |
| 0.922429906542056 | 1 |
| 0.9228971962616822 | 1 |
| 0.9233644859813084 | 1 |
| 0.9238317757009346 | 1 |
| 0.9242990654205607 | 1 |
| 0.9247663551401869 | 1 |
| 0.9252336448598131 | 1 |
| 0.9257009345794392 | 1 |
| 0.9261682242990654 | 1 |
| 0.9266355140186916 | 1 |
| 0.9271028037383178 | 1 |
| 0.927570093457944 | 1 |
| 0.9280373831775701 | 1 |
| 0.9285046728971963 | 1 |
| 0.9289719626168225 | 1 |
| 0.9294392523364486 | 1 |
| 0.9299065420560748 | 1 |
| 0.930373831775701 | 1 |
| 0.930841121495327 | 1 |
| 0.9313084112149532 | 1 |
| 0.9317757009345794 | 1 |
| 0.9322429906542056 | 1 |
| 0.9327102803738317 | 1 |
| 0.9331775700934579 | 1 |
| 0.9336448598130841 | 1 |
| 0.9341121495327103 | 1 |
| 0.9345794392523364 | 1 |
| 0.9350467289719626 | 1 |
| 0.9355140186915888 | 1 |
| 0.935981308411215 | 1 |
| 0.9364485981308411 | 1 |
| 0.9369158878504673 | 1 |
| 0.9373831775700935 | 1 |
| 0.9378504672897197 | 1 |
| 0.9383177570093458 | 1 |
| 0.938785046728972 | 1 |
| 0.9392523364485982 | 1 |
| 0.9397196261682244 | 1 |
| 0.9401869158878504 | 1 |
| 0.9406542056074766 | 1 |
| 0.9411214953271028 | 1 |
| 0.9415887850467289 | 1 |
| 0.9420560747663551 | 1 |
| 0.9425233644859813 | 1 |
| 0.9429906542056075 | 1 |
| 0.9434579439252336 | 1 |
| 0.9439252336448598 | 1 |
| 0.944392523364486 | 1 |
| 0.9448598130841122 | 1 |
| 0.9453271028037383 | 1 |
| 0.9457943925233645 | 1 |
| 0.9462616822429907 | 1 |
| 0.9467289719626168 | 1 |
| 0.947196261682243 | 1 |
| 0.9476635514018692 | 1 |
| 0.9481308411214954 | 1 |
| 0.9485981308411215 | 1 |
| 0.9490654205607477 | 1 |
| 0.9495327102803738 | 1 |
| 0.95 | 1 |
| 0.9504672897196261 | 1 |
| 0.9509345794392523 | 1 |
| 0.9514018691588785 | 1 |
| 0.9518691588785047 | 1 |
| 0.9523364485981308 | 1 |
| 0.952803738317757 | 1 |
| 0.9532710280373832 | 1 |
| 0.9537383177570093 | 1 |
| 0.9542056074766355 | 1 |
| 0.9546728971962617 | 1 |
| 0.9551401869158879 | 1 |
| 0.955607476635514 | 1 |
| 0.9560747663551402 | 1 |
| 0.9565420560747664 | 1 |
| 0.9570093457943926 | 1 |
| 0.9574766355140187 | 1 |
| 0.9579439252336449 | 1 |
| 0.958411214953271 | 1 |
| 0.9588785046728971 | 1 |
| 0.9593457943925233 | 1 |
| 0.9598130841121495 | 1 |
| 0.9602803738317757 | 1 |
| 0.9607476635514018 | 1 |
| 0.961214953271028 | 1 |
| 0.9616822429906542 | 1 |
| 0.9621495327102804 | 1 |
| 0.9626168224299065 | 1 |
| 0.9630841121495327 | 1 |
| 0.9635514018691589 | 1 |
| 0.9640186915887851 | 1 |
| 0.9644859813084112 | 1 |
| 0.9649532710280374 | 1 |
| 0.9654205607476636 | 1 |
| 0.9658878504672898 | 1 |
| 0.9663551401869159 | 1 |
| 0.9668224299065421 | 1 |
| 0.9672897196261683 | 1 |
| 0.9677570093457943 | 1 |
| 0.9682242990654205 | 1 |
| 0.9686915887850467 | 1 |
| 0.9691588785046729 | 1 |
| 0.969626168224299 | 1 |
| 0.9700934579439252 | 1 |
| 0.9705607476635514 | 1 |
| 0.9710280373831776 | 1 |
| 0.9714953271028037 | 1 |
| 0.9719626168224299 | 1 |
| 0.9724299065420561 | 1 |
| 0.9728971962616823 | 1 |
| 0.9733644859813084 | 1 |
| 0.9738317757009346 | 1 |
| 0.9742990654205608 | 1 |
| 0.974766355140187 | 1 |
| 0.9752336448598131 | 1 |
| 0.9757009345794393 | 1 |
| 0.9761682242990655 | 1 |
| 0.9766355140186916 | 1 |
| 0.9771028037383177 | 1 |
| 0.9775700934579439 | 1 |
| 0.97803738317757 | 1 |
| 0.9785046728971962 | 1 |
| 0.9789719626168224 | 1 |
| 0.9794392523364486 | 1 |
| 0.9799065420560747 | 1 |
| 0.9803738317757009 | 1 |
| 0.9808411214953271 | 1 |
| 0.9813084112149533 | 1 |
| 0.9817757009345794 | 1 |
| 0.9822429906542056 | 1 |
| 0.9827102803738318 | 1 |
| 0.983177570093458 | 1 |
| 0.9836448598130841 | 1 |
| 0.9841121495327103 | 1 |
| 0.9845794392523365 | 1 |
| 0.9850467289719627 | 1 |
| 0.9855140186915888 | 1 |
| 0.985981308411215 | 1 |
| 0.9864485981308411 | 1 |
| 0.9869158878504672 | 1 |
| 0.9873831775700934 | 1 |
| 0.9878504672897196 | 1 |
| 0.9883177570093458 | 1 |
| 0.9887850467289719 | 1 |
| 0.9892523364485981 | 1 |
| 0.9897196261682243 | 1 |
| 0.9901869158878505 | 1 |
| 0.9906542056074766 | 1 |
| 0.9911214953271028 | 1 |
| 0.991588785046729 | 1 |
| 0.9920560747663552 | 1 |
| 0.9925233644859813 | 1 |
| 0.9929906542056075 | 1 |
| 0.9934579439252337 | 1 |
| 0.9939252336448599 | 1 |
| 0.994392523364486 | 1 |
| 0.9948598130841122 | 1 |
| 0.9953271028037384 | 1 |
| 0.9957943925233644 | 1 |
| 0.9962616822429906 | 1 |
| 0.9967289719626168 | 1 |
| 0.997196261682243 | 1 |
| 0.9976635514018691 | 1 |
| 0.9981308411214953 | 1 |
| 0.9985981308411215 | 1 |
| 0.9990654205607477 | 1 |
| 0.9995327102803738 | 1 |
| 1.0 | 1 |